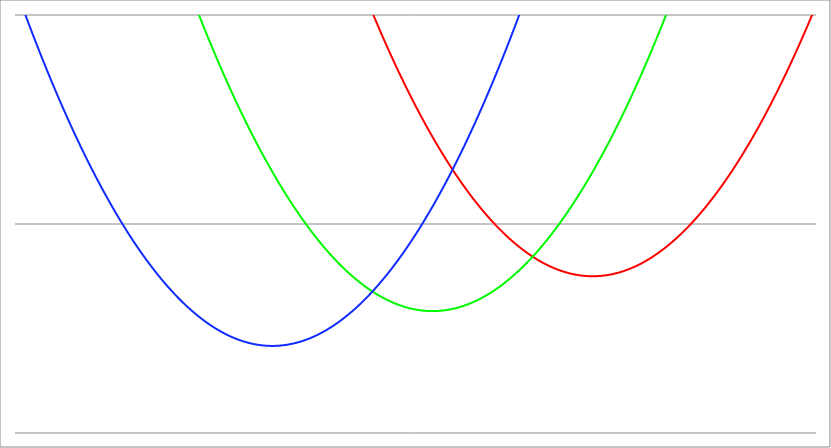
| Category | Series 1 | Series 0 | Series 2 |
|---|---|---|---|
| -5.2 | 50.34 | 24.54 | 6.74 |
| -5.195 | 50.268 | 24.488 | 6.708 |
| -5.19 | 50.196 | 24.436 | 6.676 |
| -5.185 | 50.124 | 24.384 | 6.644 |
| -5.180000000000001 | 50.052 | 24.332 | 6.612 |
| -5.175000000000001 | 49.981 | 24.281 | 6.581 |
| -5.170000000000001 | 49.909 | 24.229 | 6.549 |
| -5.165000000000001 | 49.837 | 24.177 | 6.517 |
| -5.160000000000001 | 49.766 | 24.126 | 6.486 |
| -5.155000000000001 | 49.694 | 24.074 | 6.454 |
| -5.150000000000001 | 49.623 | 24.023 | 6.423 |
| -5.145000000000001 | 49.551 | 23.971 | 6.391 |
| -5.140000000000001 | 49.48 | 23.92 | 6.36 |
| -5.135000000000002 | 49.408 | 23.868 | 6.328 |
| -5.130000000000002 | 49.337 | 23.817 | 6.297 |
| -5.125000000000002 | 49.266 | 23.766 | 6.266 |
| -5.120000000000002 | 49.194 | 23.714 | 6.234 |
| -5.115000000000002 | 49.123 | 23.663 | 6.203 |
| -5.110000000000002 | 49.052 | 23.612 | 6.172 |
| -5.105000000000002 | 48.981 | 23.561 | 6.141 |
| -5.100000000000002 | 48.91 | 23.51 | 6.11 |
| -5.095000000000002 | 48.839 | 23.459 | 6.079 |
| -5.090000000000002 | 48.768 | 23.408 | 6.048 |
| -5.085000000000003 | 48.697 | 23.357 | 6.017 |
| -5.080000000000003 | 48.626 | 23.306 | 5.986 |
| -5.075000000000003 | 48.556 | 23.256 | 5.956 |
| -5.070000000000003 | 48.485 | 23.205 | 5.925 |
| -5.065000000000003 | 48.414 | 23.154 | 5.894 |
| -5.060000000000003 | 48.344 | 23.104 | 5.864 |
| -5.055000000000003 | 48.273 | 23.053 | 5.833 |
| -5.050000000000003 | 48.203 | 23.003 | 5.803 |
| -5.045000000000003 | 48.132 | 22.952 | 5.772 |
| -5.040000000000004 | 48.062 | 22.902 | 5.742 |
| -5.035000000000004 | 47.991 | 22.851 | 5.711 |
| -5.030000000000004 | 47.921 | 22.801 | 5.681 |
| -5.025000000000004 | 47.851 | 22.751 | 5.651 |
| -5.020000000000004 | 47.78 | 22.7 | 5.62 |
| -5.015000000000004 | 47.71 | 22.65 | 5.59 |
| -5.010000000000004 | 47.64 | 22.6 | 5.56 |
| -5.005000000000004 | 47.57 | 22.55 | 5.53 |
| -5.000000000000004 | 47.5 | 22.5 | 5.5 |
| -4.995000000000004 | 47.43 | 22.45 | 5.47 |
| -4.990000000000004 | 47.36 | 22.4 | 5.44 |
| -4.985000000000004 | 47.29 | 22.35 | 5.41 |
| -4.980000000000004 | 47.22 | 22.3 | 5.38 |
| -4.975000000000004 | 47.151 | 22.251 | 5.351 |
| -4.970000000000005 | 47.081 | 22.201 | 5.321 |
| -4.965000000000005 | 47.011 | 22.151 | 5.291 |
| -4.960000000000005 | 46.942 | 22.102 | 5.262 |
| -4.955000000000005 | 46.872 | 22.052 | 5.232 |
| -4.950000000000005 | 46.803 | 22.003 | 5.203 |
| -4.945000000000005 | 46.733 | 21.953 | 5.173 |
| -4.940000000000005 | 46.664 | 21.904 | 5.144 |
| -4.935000000000005 | 46.594 | 21.854 | 5.114 |
| -4.930000000000005 | 46.525 | 21.805 | 5.085 |
| -4.925000000000006 | 46.456 | 21.756 | 5.056 |
| -4.920000000000006 | 46.386 | 21.706 | 5.026 |
| -4.915000000000006 | 46.317 | 21.657 | 4.997 |
| -4.910000000000006 | 46.248 | 21.608 | 4.968 |
| -4.905000000000006 | 46.179 | 21.559 | 4.939 |
| -4.900000000000006 | 46.11 | 21.51 | 4.91 |
| -4.895000000000007 | 46.041 | 21.461 | 4.881 |
| -4.890000000000007 | 45.972 | 21.412 | 4.852 |
| -4.885000000000007 | 45.903 | 21.363 | 4.823 |
| -4.880000000000007 | 45.834 | 21.314 | 4.794 |
| -4.875000000000007 | 45.766 | 21.266 | 4.766 |
| -4.870000000000007 | 45.697 | 21.217 | 4.737 |
| -4.865000000000007 | 45.628 | 21.168 | 4.708 |
| -4.860000000000007 | 45.56 | 21.12 | 4.68 |
| -4.855000000000007 | 45.491 | 21.071 | 4.651 |
| -4.850000000000008 | 45.423 | 21.023 | 4.623 |
| -4.845000000000008 | 45.354 | 20.974 | 4.594 |
| -4.840000000000008 | 45.286 | 20.926 | 4.566 |
| -4.835000000000008 | 45.217 | 20.877 | 4.537 |
| -4.830000000000008 | 45.149 | 20.829 | 4.509 |
| -4.825000000000008 | 45.081 | 20.781 | 4.481 |
| -4.820000000000008 | 45.012 | 20.732 | 4.452 |
| -4.815000000000008 | 44.944 | 20.684 | 4.424 |
| -4.810000000000008 | 44.876 | 20.636 | 4.396 |
| -4.805000000000009 | 44.808 | 20.588 | 4.368 |
| -4.800000000000009 | 44.74 | 20.54 | 4.34 |
| -4.795000000000009 | 44.672 | 20.492 | 4.312 |
| -4.790000000000009 | 44.604 | 20.444 | 4.284 |
| -4.785000000000009 | 44.536 | 20.396 | 4.256 |
| -4.78000000000001 | 44.468 | 20.348 | 4.228 |
| -4.77500000000001 | 44.401 | 20.301 | 4.201 |
| -4.77000000000001 | 44.333 | 20.253 | 4.173 |
| -4.765000000000009 | 44.265 | 20.205 | 4.145 |
| -4.760000000000009 | 44.198 | 20.158 | 4.118 |
| -4.75500000000001 | 44.13 | 20.11 | 4.09 |
| -4.75000000000001 | 44.063 | 20.063 | 4.063 |
| -4.74500000000001 | 43.995 | 20.015 | 4.035 |
| -4.74000000000001 | 43.928 | 19.968 | 4.008 |
| -4.73500000000001 | 43.86 | 19.92 | 3.98 |
| -4.73000000000001 | 43.793 | 19.873 | 3.953 |
| -4.72500000000001 | 43.726 | 19.826 | 3.926 |
| -4.72000000000001 | 43.658 | 19.778 | 3.898 |
| -4.71500000000001 | 43.591 | 19.731 | 3.871 |
| -4.710000000000011 | 43.524 | 19.684 | 3.844 |
| -4.705000000000011 | 43.457 | 19.637 | 3.817 |
| -4.700000000000011 | 43.39 | 19.59 | 3.79 |
| -4.695000000000011 | 43.323 | 19.543 | 3.763 |
| -4.690000000000011 | 43.256 | 19.496 | 3.736 |
| -4.685000000000011 | 43.189 | 19.449 | 3.709 |
| -4.680000000000011 | 43.122 | 19.402 | 3.682 |
| -4.675000000000011 | 43.056 | 19.356 | 3.656 |
| -4.670000000000011 | 42.989 | 19.309 | 3.629 |
| -4.665000000000011 | 42.922 | 19.262 | 3.602 |
| -4.660000000000012 | 42.856 | 19.216 | 3.576 |
| -4.655000000000012 | 42.789 | 19.169 | 3.549 |
| -4.650000000000012 | 42.723 | 19.123 | 3.523 |
| -4.645000000000012 | 42.656 | 19.076 | 3.496 |
| -4.640000000000012 | 42.59 | 19.03 | 3.47 |
| -4.635000000000012 | 42.523 | 18.983 | 3.443 |
| -4.630000000000012 | 42.457 | 18.937 | 3.417 |
| -4.625000000000012 | 42.391 | 18.891 | 3.391 |
| -4.620000000000012 | 42.324 | 18.844 | 3.364 |
| -4.615000000000013 | 42.258 | 18.798 | 3.338 |
| -4.610000000000013 | 42.192 | 18.752 | 3.312 |
| -4.605000000000013 | 42.126 | 18.706 | 3.286 |
| -4.600000000000013 | 42.06 | 18.66 | 3.26 |
| -4.595000000000013 | 41.994 | 18.614 | 3.234 |
| -4.590000000000013 | 41.928 | 18.568 | 3.208 |
| -4.585000000000013 | 41.862 | 18.522 | 3.182 |
| -4.580000000000013 | 41.796 | 18.476 | 3.156 |
| -4.575000000000013 | 41.731 | 18.431 | 3.131 |
| -4.570000000000014 | 41.665 | 18.385 | 3.105 |
| -4.565000000000014 | 41.599 | 18.339 | 3.079 |
| -4.560000000000014 | 41.534 | 18.294 | 3.054 |
| -4.555000000000014 | 41.468 | 18.248 | 3.028 |
| -4.550000000000014 | 41.403 | 18.203 | 3.003 |
| -4.545000000000014 | 41.337 | 18.157 | 2.977 |
| -4.540000000000014 | 41.272 | 18.112 | 2.952 |
| -4.535000000000014 | 41.206 | 18.066 | 2.926 |
| -4.530000000000014 | 41.141 | 18.021 | 2.901 |
| -4.525000000000015 | 41.076 | 17.976 | 2.876 |
| -4.520000000000015 | 41.01 | 17.93 | 2.85 |
| -4.515000000000015 | 40.945 | 17.885 | 2.825 |
| -4.510000000000015 | 40.88 | 17.84 | 2.8 |
| -4.505000000000015 | 40.815 | 17.795 | 2.775 |
| -4.500000000000015 | 40.75 | 17.75 | 2.75 |
| -4.495000000000015 | 40.685 | 17.705 | 2.725 |
| -4.490000000000015 | 40.62 | 17.66 | 2.7 |
| -4.485000000000015 | 40.555 | 17.615 | 2.675 |
| -4.480000000000015 | 40.49 | 17.57 | 2.65 |
| -4.475000000000015 | 40.426 | 17.526 | 2.626 |
| -4.470000000000015 | 40.361 | 17.481 | 2.601 |
| -4.465000000000016 | 40.296 | 17.436 | 2.576 |
| -4.460000000000016 | 40.232 | 17.392 | 2.552 |
| -4.455000000000016 | 40.167 | 17.347 | 2.527 |
| -4.450000000000016 | 40.103 | 17.303 | 2.503 |
| -4.445000000000016 | 40.038 | 17.258 | 2.478 |
| -4.440000000000016 | 39.974 | 17.214 | 2.454 |
| -4.435000000000016 | 39.909 | 17.169 | 2.429 |
| -4.430000000000016 | 39.845 | 17.125 | 2.405 |
| -4.425000000000017 | 39.781 | 17.081 | 2.381 |
| -4.420000000000017 | 39.716 | 17.036 | 2.356 |
| -4.415000000000017 | 39.652 | 16.992 | 2.332 |
| -4.410000000000017 | 39.588 | 16.948 | 2.308 |
| -4.405000000000017 | 39.524 | 16.904 | 2.284 |
| -4.400000000000017 | 39.46 | 16.86 | 2.26 |
| -4.395000000000017 | 39.396 | 16.816 | 2.236 |
| -4.390000000000017 | 39.332 | 16.772 | 2.212 |
| -4.385000000000017 | 39.268 | 16.728 | 2.188 |
| -4.380000000000018 | 39.204 | 16.684 | 2.164 |
| -4.375000000000018 | 39.141 | 16.641 | 2.141 |
| -4.370000000000018 | 39.077 | 16.597 | 2.117 |
| -4.365000000000018 | 39.013 | 16.553 | 2.093 |
| -4.360000000000018 | 38.95 | 16.51 | 2.07 |
| -4.355000000000018 | 38.886 | 16.466 | 2.046 |
| -4.350000000000018 | 38.823 | 16.423 | 2.023 |
| -4.345000000000018 | 38.759 | 16.379 | 1.999 |
| -4.340000000000018 | 38.696 | 16.336 | 1.976 |
| -4.335000000000019 | 38.632 | 16.292 | 1.952 |
| -4.330000000000019 | 38.569 | 16.249 | 1.929 |
| -4.325000000000019 | 38.506 | 16.206 | 1.906 |
| -4.320000000000019 | 38.442 | 16.162 | 1.882 |
| -4.315000000000019 | 38.379 | 16.119 | 1.859 |
| -4.310000000000019 | 38.316 | 16.076 | 1.836 |
| -4.305000000000019 | 38.253 | 16.033 | 1.813 |
| -4.300000000000019 | 38.19 | 15.99 | 1.79 |
| -4.295000000000019 | 38.127 | 15.947 | 1.767 |
| -4.29000000000002 | 38.064 | 15.904 | 1.744 |
| -4.28500000000002 | 38.001 | 15.861 | 1.721 |
| -4.28000000000002 | 37.938 | 15.818 | 1.698 |
| -4.27500000000002 | 37.876 | 15.776 | 1.676 |
| -4.27000000000002 | 37.813 | 15.733 | 1.653 |
| -4.26500000000002 | 37.75 | 15.69 | 1.63 |
| -4.26000000000002 | 37.688 | 15.648 | 1.608 |
| -4.25500000000002 | 37.625 | 15.605 | 1.585 |
| -4.25000000000002 | 37.563 | 15.563 | 1.563 |
| -4.24500000000002 | 37.5 | 15.52 | 1.54 |
| -4.24000000000002 | 37.438 | 15.478 | 1.518 |
| -4.23500000000002 | 37.375 | 15.435 | 1.495 |
| -4.23000000000002 | 37.313 | 15.393 | 1.473 |
| -4.225000000000021 | 37.251 | 15.351 | 1.451 |
| -4.220000000000021 | 37.188 | 15.308 | 1.428 |
| -4.215000000000021 | 37.126 | 15.266 | 1.406 |
| -4.210000000000021 | 37.064 | 15.224 | 1.384 |
| -4.205000000000021 | 37.002 | 15.182 | 1.362 |
| -4.200000000000021 | 36.94 | 15.14 | 1.34 |
| -4.195000000000022 | 36.878 | 15.098 | 1.318 |
| -4.190000000000022 | 36.816 | 15.056 | 1.296 |
| -4.185000000000022 | 36.754 | 15.014 | 1.274 |
| -4.180000000000022 | 36.692 | 14.972 | 1.252 |
| -4.175000000000022 | 36.631 | 14.931 | 1.231 |
| -4.170000000000022 | 36.569 | 14.889 | 1.209 |
| -4.165000000000022 | 36.507 | 14.847 | 1.187 |
| -4.160000000000022 | 36.446 | 14.806 | 1.166 |
| -4.155000000000022 | 36.384 | 14.764 | 1.144 |
| -4.150000000000023 | 36.323 | 14.723 | 1.123 |
| -4.145000000000023 | 36.261 | 14.681 | 1.101 |
| -4.140000000000023 | 36.2 | 14.64 | 1.08 |
| -4.135000000000023 | 36.138 | 14.598 | 1.058 |
| -4.130000000000023 | 36.077 | 14.557 | 1.037 |
| -4.125000000000023 | 36.016 | 14.516 | 1.016 |
| -4.120000000000023 | 35.954 | 14.474 | 0.994 |
| -4.115000000000023 | 35.893 | 14.433 | 0.973 |
| -4.110000000000023 | 35.832 | 14.392 | 0.952 |
| -4.105000000000024 | 35.771 | 14.351 | 0.931 |
| -4.100000000000024 | 35.71 | 14.31 | 0.91 |
| -4.095000000000024 | 35.649 | 14.269 | 0.889 |
| -4.090000000000024 | 35.588 | 14.228 | 0.868 |
| -4.085000000000024 | 35.527 | 14.187 | 0.847 |
| -4.080000000000024 | 35.466 | 14.146 | 0.826 |
| -4.075000000000024 | 35.406 | 14.106 | 0.806 |
| -4.070000000000024 | 35.345 | 14.065 | 0.785 |
| -4.065000000000024 | 35.284 | 14.024 | 0.764 |
| -4.060000000000024 | 35.224 | 13.984 | 0.744 |
| -4.055000000000024 | 35.163 | 13.943 | 0.723 |
| -4.050000000000024 | 35.103 | 13.903 | 0.703 |
| -4.045000000000024 | 35.042 | 13.862 | 0.682 |
| -4.040000000000024 | 34.982 | 13.822 | 0.662 |
| -4.035000000000025 | 34.921 | 13.781 | 0.641 |
| -4.030000000000025 | 34.861 | 13.741 | 0.621 |
| -4.025000000000025 | 34.801 | 13.701 | 0.601 |
| -4.020000000000025 | 34.74 | 13.66 | 0.58 |
| -4.015000000000025 | 34.68 | 13.62 | 0.56 |
| -4.010000000000025 | 34.62 | 13.58 | 0.54 |
| -4.005000000000025 | 34.56 | 13.54 | 0.52 |
| -4.000000000000025 | 34.5 | 13.5 | 0.5 |
| -3.995000000000026 | 34.44 | 13.46 | 0.48 |
| -3.990000000000026 | 34.38 | 13.42 | 0.46 |
| -3.985000000000026 | 34.32 | 13.38 | 0.44 |
| -3.980000000000026 | 34.26 | 13.34 | 0.42 |
| -3.975000000000026 | 34.201 | 13.301 | 0.401 |
| -3.970000000000026 | 34.141 | 13.261 | 0.381 |
| -3.965000000000026 | 34.081 | 13.221 | 0.361 |
| -3.960000000000027 | 34.022 | 13.182 | 0.342 |
| -3.955000000000027 | 33.962 | 13.142 | 0.322 |
| -3.950000000000027 | 33.903 | 13.103 | 0.303 |
| -3.945000000000027 | 33.843 | 13.063 | 0.283 |
| -3.940000000000027 | 33.784 | 13.024 | 0.264 |
| -3.935000000000027 | 33.724 | 12.984 | 0.244 |
| -3.930000000000027 | 33.665 | 12.945 | 0.225 |
| -3.925000000000027 | 33.606 | 12.906 | 0.206 |
| -3.920000000000027 | 33.546 | 12.866 | 0.186 |
| -3.915000000000028 | 33.487 | 12.827 | 0.167 |
| -3.910000000000028 | 33.428 | 12.788 | 0.148 |
| -3.905000000000028 | 33.369 | 12.749 | 0.129 |
| -3.900000000000028 | 33.31 | 12.71 | 0.11 |
| -3.895000000000028 | 33.251 | 12.671 | 0.091 |
| -3.890000000000028 | 33.192 | 12.632 | 0.072 |
| -3.885000000000028 | 33.133 | 12.593 | 0.053 |
| -3.880000000000028 | 33.074 | 12.554 | 0.034 |
| -3.875000000000028 | 33.016 | 12.516 | 0.016 |
| -3.870000000000028 | 32.957 | 12.477 | -0.003 |
| -3.865000000000029 | 32.898 | 12.438 | -0.022 |
| -3.860000000000029 | 32.84 | 12.4 | -0.04 |
| -3.855000000000029 | 32.781 | 12.361 | -0.059 |
| -3.850000000000029 | 32.723 | 12.323 | -0.077 |
| -3.845000000000029 | 32.664 | 12.284 | -0.096 |
| -3.840000000000029 | 32.606 | 12.246 | -0.114 |
| -3.835000000000029 | 32.547 | 12.207 | -0.133 |
| -3.830000000000029 | 32.489 | 12.169 | -0.151 |
| -3.825000000000029 | 32.431 | 12.131 | -0.169 |
| -3.82000000000003 | 32.372 | 12.092 | -0.188 |
| -3.81500000000003 | 32.314 | 12.054 | -0.206 |
| -3.81000000000003 | 32.256 | 12.016 | -0.224 |
| -3.80500000000003 | 32.198 | 11.978 | -0.242 |
| -3.80000000000003 | 32.14 | 11.94 | -0.26 |
| -3.79500000000003 | 32.082 | 11.902 | -0.278 |
| -3.79000000000003 | 32.024 | 11.864 | -0.296 |
| -3.78500000000003 | 31.966 | 11.826 | -0.314 |
| -3.78000000000003 | 31.908 | 11.788 | -0.332 |
| -3.77500000000003 | 31.851 | 11.751 | -0.349 |
| -3.770000000000031 | 31.793 | 11.713 | -0.367 |
| -3.765000000000031 | 31.735 | 11.675 | -0.385 |
| -3.760000000000031 | 31.678 | 11.638 | -0.402 |
| -3.755000000000031 | 31.62 | 11.6 | -0.42 |
| -3.750000000000031 | 31.563 | 11.563 | -0.437 |
| -3.745000000000031 | 31.505 | 11.525 | -0.455 |
| -3.740000000000031 | 31.448 | 11.488 | -0.472 |
| -3.735000000000031 | 31.39 | 11.45 | -0.49 |
| -3.730000000000031 | 31.333 | 11.413 | -0.507 |
| -3.725000000000032 | 31.276 | 11.376 | -0.524 |
| -3.720000000000032 | 31.218 | 11.338 | -0.542 |
| -3.715000000000032 | 31.161 | 11.301 | -0.559 |
| -3.710000000000032 | 31.104 | 11.264 | -0.576 |
| -3.705000000000032 | 31.047 | 11.227 | -0.593 |
| -3.700000000000032 | 30.99 | 11.19 | -0.61 |
| -3.695000000000032 | 30.933 | 11.153 | -0.627 |
| -3.690000000000032 | 30.876 | 11.116 | -0.644 |
| -3.685000000000032 | 30.819 | 11.079 | -0.661 |
| -3.680000000000032 | 30.762 | 11.042 | -0.678 |
| -3.675000000000033 | 30.706 | 11.006 | -0.694 |
| -3.670000000000033 | 30.649 | 10.969 | -0.711 |
| -3.665000000000033 | 30.592 | 10.932 | -0.728 |
| -3.660000000000033 | 30.536 | 10.896 | -0.744 |
| -3.655000000000033 | 30.479 | 10.859 | -0.761 |
| -3.650000000000033 | 30.423 | 10.823 | -0.777 |
| -3.645000000000033 | 30.366 | 10.786 | -0.794 |
| -3.640000000000033 | 30.31 | 10.75 | -0.81 |
| -3.635000000000033 | 30.253 | 10.713 | -0.827 |
| -3.630000000000034 | 30.197 | 10.677 | -0.843 |
| -3.625000000000034 | 30.141 | 10.641 | -0.859 |
| -3.620000000000034 | 30.084 | 10.604 | -0.876 |
| -3.615000000000034 | 30.028 | 10.568 | -0.892 |
| -3.610000000000034 | 29.972 | 10.532 | -0.908 |
| -3.605000000000034 | 29.916 | 10.496 | -0.924 |
| -3.600000000000034 | 29.86 | 10.46 | -0.94 |
| -3.595000000000034 | 29.804 | 10.424 | -0.956 |
| -3.590000000000034 | 29.748 | 10.388 | -0.972 |
| -3.585000000000035 | 29.692 | 10.352 | -0.988 |
| -3.580000000000035 | 29.636 | 10.316 | -1.004 |
| -3.575000000000035 | 29.581 | 10.281 | -1.019 |
| -3.570000000000035 | 29.525 | 10.245 | -1.035 |
| -3.565000000000035 | 29.469 | 10.209 | -1.051 |
| -3.560000000000035 | 29.414 | 10.174 | -1.066 |
| -3.555000000000035 | 29.358 | 10.138 | -1.082 |
| -3.550000000000035 | 29.303 | 10.103 | -1.097 |
| -3.545000000000035 | 29.247 | 10.067 | -1.113 |
| -3.540000000000036 | 29.192 | 10.032 | -1.128 |
| -3.535000000000036 | 29.136 | 9.996 | -1.144 |
| -3.530000000000036 | 29.081 | 9.961 | -1.159 |
| -3.525000000000036 | 29.026 | 9.926 | -1.174 |
| -3.520000000000036 | 28.97 | 9.89 | -1.19 |
| -3.515000000000036 | 28.915 | 9.855 | -1.205 |
| -3.510000000000036 | 28.86 | 9.82 | -1.22 |
| -3.505000000000036 | 28.805 | 9.785 | -1.235 |
| -3.500000000000036 | 28.75 | 9.75 | -1.25 |
| -3.495000000000036 | 28.695 | 9.715 | -1.265 |
| -3.490000000000037 | 28.64 | 9.68 | -1.28 |
| -3.485000000000037 | 28.585 | 9.645 | -1.295 |
| -3.480000000000037 | 28.53 | 9.61 | -1.31 |
| -3.475000000000037 | 28.476 | 9.576 | -1.324 |
| -3.470000000000037 | 28.421 | 9.541 | -1.339 |
| -3.465000000000037 | 28.366 | 9.506 | -1.354 |
| -3.460000000000037 | 28.312 | 9.472 | -1.368 |
| -3.455000000000037 | 28.257 | 9.437 | -1.383 |
| -3.450000000000037 | 28.203 | 9.403 | -1.397 |
| -3.445000000000038 | 28.148 | 9.368 | -1.412 |
| -3.440000000000038 | 28.094 | 9.334 | -1.426 |
| -3.435000000000038 | 28.039 | 9.299 | -1.441 |
| -3.430000000000038 | 27.985 | 9.265 | -1.455 |
| -3.425000000000038 | 27.931 | 9.231 | -1.469 |
| -3.420000000000038 | 27.876 | 9.196 | -1.484 |
| -3.415000000000038 | 27.822 | 9.162 | -1.498 |
| -3.410000000000038 | 27.768 | 9.128 | -1.512 |
| -3.405000000000038 | 27.714 | 9.094 | -1.526 |
| -3.400000000000039 | 27.66 | 9.06 | -1.54 |
| -3.395000000000039 | 27.606 | 9.026 | -1.554 |
| -3.390000000000039 | 27.552 | 8.992 | -1.568 |
| -3.385000000000039 | 27.498 | 8.958 | -1.582 |
| -3.380000000000039 | 27.444 | 8.924 | -1.596 |
| -3.375000000000039 | 27.391 | 8.891 | -1.609 |
| -3.370000000000039 | 27.337 | 8.857 | -1.623 |
| -3.365000000000039 | 27.283 | 8.823 | -1.637 |
| -3.360000000000039 | 27.23 | 8.79 | -1.65 |
| -3.355000000000039 | 27.176 | 8.756 | -1.664 |
| -3.35000000000004 | 27.123 | 8.723 | -1.677 |
| -3.34500000000004 | 27.069 | 8.689 | -1.691 |
| -3.34000000000004 | 27.016 | 8.656 | -1.704 |
| -3.33500000000004 | 26.962 | 8.622 | -1.718 |
| -3.33000000000004 | 26.909 | 8.589 | -1.731 |
| -3.32500000000004 | 26.856 | 8.556 | -1.744 |
| -3.32000000000004 | 26.802 | 8.522 | -1.758 |
| -3.31500000000004 | 26.749 | 8.489 | -1.771 |
| -3.31000000000004 | 26.696 | 8.456 | -1.784 |
| -3.305000000000041 | 26.643 | 8.423 | -1.797 |
| -3.300000000000041 | 26.59 | 8.39 | -1.81 |
| -3.295000000000041 | 26.537 | 8.357 | -1.823 |
| -3.290000000000041 | 26.484 | 8.324 | -1.836 |
| -3.285000000000041 | 26.431 | 8.291 | -1.849 |
| -3.280000000000041 | 26.378 | 8.258 | -1.862 |
| -3.275000000000041 | 26.326 | 8.226 | -1.874 |
| -3.270000000000041 | 26.273 | 8.193 | -1.887 |
| -3.265000000000041 | 26.22 | 8.16 | -1.9 |
| -3.260000000000042 | 26.168 | 8.128 | -1.912 |
| -3.255000000000042 | 26.115 | 8.095 | -1.925 |
| -3.250000000000042 | 26.063 | 8.063 | -1.937 |
| -3.245000000000042 | 26.01 | 8.03 | -1.95 |
| -3.240000000000042 | 25.958 | 7.998 | -1.962 |
| -3.235000000000042 | 25.905 | 7.965 | -1.975 |
| -3.230000000000042 | 25.853 | 7.933 | -1.987 |
| -3.225000000000042 | 25.801 | 7.901 | -1.999 |
| -3.220000000000042 | 25.748 | 7.868 | -2.012 |
| -3.215000000000042 | 25.696 | 7.836 | -2.024 |
| -3.210000000000043 | 25.644 | 7.804 | -2.036 |
| -3.205000000000043 | 25.592 | 7.772 | -2.048 |
| -3.200000000000043 | 25.54 | 7.74 | -2.06 |
| -3.195000000000043 | 25.488 | 7.708 | -2.072 |
| -3.190000000000043 | 25.436 | 7.676 | -2.084 |
| -3.185000000000043 | 25.384 | 7.644 | -2.096 |
| -3.180000000000043 | 25.332 | 7.612 | -2.108 |
| -3.175000000000043 | 25.281 | 7.581 | -2.119 |
| -3.170000000000043 | 25.229 | 7.549 | -2.131 |
| -3.165000000000044 | 25.177 | 7.517 | -2.143 |
| -3.160000000000044 | 25.126 | 7.486 | -2.154 |
| -3.155000000000044 | 25.074 | 7.454 | -2.166 |
| -3.150000000000044 | 25.023 | 7.423 | -2.177 |
| -3.145000000000044 | 24.971 | 7.391 | -2.189 |
| -3.140000000000044 | 24.92 | 7.36 | -2.2 |
| -3.135000000000044 | 24.868 | 7.328 | -2.212 |
| -3.130000000000044 | 24.817 | 7.297 | -2.223 |
| -3.125000000000044 | 24.766 | 7.266 | -2.234 |
| -3.120000000000045 | 24.714 | 7.234 | -2.246 |
| -3.115000000000045 | 24.663 | 7.203 | -2.257 |
| -3.110000000000045 | 24.612 | 7.172 | -2.268 |
| -3.105000000000045 | 24.561 | 7.141 | -2.279 |
| -3.100000000000045 | 24.51 | 7.11 | -2.29 |
| -3.095000000000045 | 24.459 | 7.079 | -2.301 |
| -3.090000000000045 | 24.408 | 7.048 | -2.312 |
| -3.085000000000045 | 24.357 | 7.017 | -2.323 |
| -3.080000000000045 | 24.306 | 6.986 | -2.334 |
| -3.075000000000045 | 24.256 | 6.956 | -2.344 |
| -3.070000000000046 | 24.205 | 6.925 | -2.355 |
| -3.065000000000046 | 24.154 | 6.894 | -2.366 |
| -3.060000000000046 | 24.104 | 6.864 | -2.376 |
| -3.055000000000046 | 24.053 | 6.833 | -2.387 |
| -3.050000000000046 | 24.003 | 6.803 | -2.397 |
| -3.045000000000046 | 23.952 | 6.772 | -2.408 |
| -3.040000000000046 | 23.902 | 6.742 | -2.418 |
| -3.035000000000046 | 23.851 | 6.711 | -2.429 |
| -3.030000000000046 | 23.801 | 6.681 | -2.439 |
| -3.025000000000047 | 23.751 | 6.651 | -2.449 |
| -3.020000000000047 | 23.7 | 6.62 | -2.46 |
| -3.015000000000047 | 23.65 | 6.59 | -2.47 |
| -3.010000000000047 | 23.6 | 6.56 | -2.48 |
| -3.005000000000047 | 23.55 | 6.53 | -2.49 |
| -3.000000000000047 | 23.5 | 6.5 | -2.5 |
| -2.995000000000047 | 23.45 | 6.47 | -2.51 |
| -2.990000000000047 | 23.4 | 6.44 | -2.52 |
| -2.985000000000047 | 23.35 | 6.41 | -2.53 |
| -2.980000000000047 | 23.3 | 6.38 | -2.54 |
| -2.975000000000048 | 23.251 | 6.351 | -2.549 |
| -2.970000000000048 | 23.201 | 6.321 | -2.559 |
| -2.965000000000048 | 23.151 | 6.291 | -2.569 |
| -2.960000000000048 | 23.102 | 6.262 | -2.578 |
| -2.955000000000048 | 23.052 | 6.232 | -2.588 |
| -2.950000000000048 | 23.003 | 6.203 | -2.597 |
| -2.945000000000048 | 22.953 | 6.173 | -2.607 |
| -2.940000000000048 | 22.904 | 6.144 | -2.616 |
| -2.935000000000048 | 22.854 | 6.114 | -2.626 |
| -2.930000000000049 | 22.805 | 6.085 | -2.635 |
| -2.925000000000049 | 22.756 | 6.056 | -2.644 |
| -2.920000000000049 | 22.706 | 6.026 | -2.654 |
| -2.915000000000049 | 22.657 | 5.997 | -2.663 |
| -2.910000000000049 | 22.608 | 5.968 | -2.672 |
| -2.905000000000049 | 22.559 | 5.939 | -2.681 |
| -2.900000000000049 | 22.51 | 5.91 | -2.69 |
| -2.895000000000049 | 22.461 | 5.881 | -2.699 |
| -2.890000000000049 | 22.412 | 5.852 | -2.708 |
| -2.885000000000049 | 22.363 | 5.823 | -2.717 |
| -2.88000000000005 | 22.314 | 5.794 | -2.726 |
| -2.87500000000005 | 22.266 | 5.766 | -2.734 |
| -2.87000000000005 | 22.217 | 5.737 | -2.743 |
| -2.86500000000005 | 22.168 | 5.708 | -2.752 |
| -2.86000000000005 | 22.12 | 5.68 | -2.76 |
| -2.85500000000005 | 22.071 | 5.651 | -2.769 |
| -2.85000000000005 | 22.023 | 5.623 | -2.777 |
| -2.84500000000005 | 21.974 | 5.594 | -2.786 |
| -2.84000000000005 | 21.926 | 5.566 | -2.794 |
| -2.835000000000051 | 21.877 | 5.537 | -2.803 |
| -2.830000000000051 | 21.829 | 5.509 | -2.811 |
| -2.825000000000051 | 21.781 | 5.481 | -2.819 |
| -2.820000000000051 | 21.732 | 5.452 | -2.828 |
| -2.815000000000051 | 21.684 | 5.424 | -2.836 |
| -2.810000000000051 | 21.636 | 5.396 | -2.844 |
| -2.805000000000051 | 21.588 | 5.368 | -2.852 |
| -2.800000000000051 | 21.54 | 5.34 | -2.86 |
| -2.795000000000051 | 21.492 | 5.312 | -2.868 |
| -2.790000000000051 | 21.444 | 5.284 | -2.876 |
| -2.785000000000052 | 21.396 | 5.256 | -2.884 |
| -2.780000000000052 | 21.348 | 5.228 | -2.892 |
| -2.775000000000052 | 21.301 | 5.201 | -2.899 |
| -2.770000000000052 | 21.253 | 5.173 | -2.907 |
| -2.765000000000052 | 21.205 | 5.145 | -2.915 |
| -2.760000000000052 | 21.158 | 5.118 | -2.922 |
| -2.755000000000052 | 21.11 | 5.09 | -2.93 |
| -2.750000000000052 | 21.063 | 5.063 | -2.937 |
| -2.745000000000052 | 21.015 | 5.035 | -2.945 |
| -2.740000000000052 | 20.968 | 5.008 | -2.952 |
| -2.735000000000053 | 20.92 | 4.98 | -2.96 |
| -2.730000000000053 | 20.873 | 4.953 | -2.967 |
| -2.725000000000053 | 20.826 | 4.926 | -2.974 |
| -2.720000000000053 | 20.778 | 4.898 | -2.982 |
| -2.715000000000053 | 20.731 | 4.871 | -2.989 |
| -2.710000000000053 | 20.684 | 4.844 | -2.996 |
| -2.705000000000053 | 20.637 | 4.817 | -3.003 |
| -2.700000000000053 | 20.59 | 4.79 | -3.01 |
| -2.695000000000053 | 20.543 | 4.763 | -3.017 |
| -2.690000000000054 | 20.496 | 4.736 | -3.024 |
| -2.685000000000054 | 20.449 | 4.709 | -3.031 |
| -2.680000000000054 | 20.402 | 4.682 | -3.038 |
| -2.675000000000054 | 20.356 | 4.656 | -3.044 |
| -2.670000000000054 | 20.309 | 4.629 | -3.051 |
| -2.665000000000054 | 20.262 | 4.602 | -3.058 |
| -2.660000000000054 | 20.216 | 4.576 | -3.064 |
| -2.655000000000054 | 20.169 | 4.549 | -3.071 |
| -2.650000000000054 | 20.123 | 4.523 | -3.077 |
| -2.645000000000055 | 20.076 | 4.496 | -3.084 |
| -2.640000000000055 | 20.03 | 4.47 | -3.09 |
| -2.635000000000055 | 19.983 | 4.443 | -3.097 |
| -2.630000000000055 | 19.937 | 4.417 | -3.103 |
| -2.625000000000055 | 19.891 | 4.391 | -3.109 |
| -2.620000000000055 | 19.844 | 4.364 | -3.116 |
| -2.615000000000055 | 19.798 | 4.338 | -3.122 |
| -2.610000000000055 | 19.752 | 4.312 | -3.128 |
| -2.605000000000055 | 19.706 | 4.286 | -3.134 |
| -2.600000000000056 | 19.66 | 4.26 | -3.14 |
| -2.595000000000056 | 19.614 | 4.234 | -3.146 |
| -2.590000000000056 | 19.568 | 4.208 | -3.152 |
| -2.585000000000056 | 19.522 | 4.182 | -3.158 |
| -2.580000000000056 | 19.476 | 4.156 | -3.164 |
| -2.575000000000056 | 19.431 | 4.131 | -3.169 |
| -2.570000000000056 | 19.385 | 4.105 | -3.175 |
| -2.565000000000056 | 19.339 | 4.079 | -3.181 |
| -2.560000000000056 | 19.294 | 4.054 | -3.186 |
| -2.555000000000057 | 19.248 | 4.028 | -3.192 |
| -2.550000000000057 | 19.203 | 4.003 | -3.197 |
| -2.545000000000057 | 19.157 | 3.977 | -3.203 |
| -2.540000000000057 | 19.112 | 3.952 | -3.208 |
| -2.535000000000057 | 19.066 | 3.926 | -3.214 |
| -2.530000000000057 | 19.021 | 3.901 | -3.219 |
| -2.525000000000057 | 18.976 | 3.876 | -3.224 |
| -2.520000000000057 | 18.93 | 3.85 | -3.23 |
| -2.515000000000057 | 18.885 | 3.825 | -3.235 |
| -2.510000000000058 | 18.84 | 3.8 | -3.24 |
| -2.505000000000058 | 18.795 | 3.775 | -3.245 |
| -2.500000000000058 | 18.75 | 3.75 | -3.25 |
| -2.495000000000058 | 18.705 | 3.725 | -3.255 |
| -2.490000000000058 | 18.66 | 3.7 | -3.26 |
| -2.485000000000058 | 18.615 | 3.675 | -3.265 |
| -2.480000000000058 | 18.57 | 3.65 | -3.27 |
| -2.475000000000058 | 18.526 | 3.626 | -3.274 |
| -2.470000000000058 | 18.481 | 3.601 | -3.279 |
| -2.465000000000058 | 18.436 | 3.576 | -3.284 |
| -2.460000000000059 | 18.392 | 3.552 | -3.288 |
| -2.455000000000059 | 18.347 | 3.527 | -3.293 |
| -2.450000000000059 | 18.303 | 3.503 | -3.297 |
| -2.445000000000059 | 18.258 | 3.478 | -3.302 |
| -2.440000000000059 | 18.214 | 3.454 | -3.306 |
| -2.435000000000059 | 18.169 | 3.429 | -3.311 |
| -2.430000000000059 | 18.125 | 3.405 | -3.315 |
| -2.425000000000059 | 18.081 | 3.381 | -3.319 |
| -2.420000000000059 | 18.036 | 3.356 | -3.324 |
| -2.41500000000006 | 17.992 | 3.332 | -3.328 |
| -2.41000000000006 | 17.948 | 3.308 | -3.332 |
| -2.40500000000006 | 17.904 | 3.284 | -3.336 |
| -2.40000000000006 | 17.86 | 3.26 | -3.34 |
| -2.39500000000006 | 17.816 | 3.236 | -3.344 |
| -2.39000000000006 | 17.772 | 3.212 | -3.348 |
| -2.38500000000006 | 17.728 | 3.188 | -3.352 |
| -2.38000000000006 | 17.684 | 3.164 | -3.356 |
| -2.37500000000006 | 17.641 | 3.141 | -3.359 |
| -2.37000000000006 | 17.597 | 3.117 | -3.363 |
| -2.365000000000061 | 17.553 | 3.093 | -3.367 |
| -2.360000000000061 | 17.51 | 3.07 | -3.37 |
| -2.355000000000061 | 17.466 | 3.046 | -3.374 |
| -2.350000000000061 | 17.423 | 3.023 | -3.377 |
| -2.345000000000061 | 17.379 | 2.999 | -3.381 |
| -2.340000000000061 | 17.336 | 2.976 | -3.384 |
| -2.335000000000061 | 17.292 | 2.952 | -3.388 |
| -2.330000000000061 | 17.249 | 2.929 | -3.391 |
| -2.325000000000061 | 17.206 | 2.906 | -3.394 |
| -2.320000000000062 | 17.162 | 2.882 | -3.398 |
| -2.315000000000062 | 17.119 | 2.859 | -3.401 |
| -2.310000000000062 | 17.076 | 2.836 | -3.404 |
| -2.305000000000062 | 17.033 | 2.813 | -3.407 |
| -2.300000000000062 | 16.99 | 2.79 | -3.41 |
| -2.295000000000062 | 16.947 | 2.767 | -3.413 |
| -2.290000000000062 | 16.904 | 2.744 | -3.416 |
| -2.285000000000062 | 16.861 | 2.721 | -3.419 |
| -2.280000000000062 | 16.818 | 2.698 | -3.422 |
| -2.275000000000063 | 16.776 | 2.676 | -3.424 |
| -2.270000000000063 | 16.733 | 2.653 | -3.427 |
| -2.265000000000063 | 16.69 | 2.63 | -3.43 |
| -2.260000000000063 | 16.648 | 2.608 | -3.432 |
| -2.255000000000063 | 16.605 | 2.585 | -3.435 |
| -2.250000000000063 | 16.563 | 2.563 | -3.437 |
| -2.245000000000063 | 16.52 | 2.54 | -3.44 |
| -2.240000000000063 | 16.478 | 2.518 | -3.442 |
| -2.235000000000063 | 16.435 | 2.495 | -3.445 |
| -2.230000000000063 | 16.393 | 2.473 | -3.447 |
| -2.225000000000064 | 16.351 | 2.451 | -3.449 |
| -2.220000000000064 | 16.308 | 2.428 | -3.452 |
| -2.215000000000064 | 16.266 | 2.406 | -3.454 |
| -2.210000000000064 | 16.224 | 2.384 | -3.456 |
| -2.205000000000064 | 16.182 | 2.362 | -3.458 |
| -2.200000000000064 | 16.14 | 2.34 | -3.46 |
| -2.195000000000064 | 16.098 | 2.318 | -3.462 |
| -2.190000000000064 | 16.056 | 2.296 | -3.464 |
| -2.185000000000064 | 16.014 | 2.274 | -3.466 |
| -2.180000000000065 | 15.972 | 2.252 | -3.468 |
| -2.175000000000065 | 15.931 | 2.231 | -3.469 |
| -2.170000000000065 | 15.889 | 2.209 | -3.471 |
| -2.165000000000065 | 15.847 | 2.187 | -3.473 |
| -2.160000000000065 | 15.806 | 2.166 | -3.474 |
| -2.155000000000065 | 15.764 | 2.144 | -3.476 |
| -2.150000000000065 | 15.723 | 2.123 | -3.477 |
| -2.145000000000065 | 15.681 | 2.101 | -3.479 |
| -2.140000000000065 | 15.64 | 2.08 | -3.48 |
| -2.135000000000065 | 15.598 | 2.058 | -3.482 |
| -2.130000000000066 | 15.557 | 2.037 | -3.483 |
| -2.125000000000066 | 15.516 | 2.016 | -3.484 |
| -2.120000000000066 | 15.474 | 1.994 | -3.486 |
| -2.115000000000066 | 15.433 | 1.973 | -3.487 |
| -2.110000000000066 | 15.392 | 1.952 | -3.488 |
| -2.105000000000066 | 15.351 | 1.931 | -3.489 |
| -2.100000000000066 | 15.31 | 1.91 | -3.49 |
| -2.095000000000066 | 15.269 | 1.889 | -3.491 |
| -2.090000000000066 | 15.228 | 1.868 | -3.492 |
| -2.085000000000067 | 15.187 | 1.847 | -3.493 |
| -2.080000000000067 | 15.146 | 1.826 | -3.494 |
| -2.075000000000067 | 15.106 | 1.806 | -3.494 |
| -2.070000000000067 | 15.065 | 1.785 | -3.495 |
| -2.065000000000067 | 15.024 | 1.764 | -3.496 |
| -2.060000000000067 | 14.984 | 1.744 | -3.496 |
| -2.055000000000067 | 14.943 | 1.723 | -3.497 |
| -2.050000000000067 | 14.903 | 1.703 | -3.497 |
| -2.045000000000067 | 14.862 | 1.682 | -3.498 |
| -2.040000000000068 | 14.822 | 1.662 | -3.498 |
| -2.035000000000068 | 14.781 | 1.641 | -3.499 |
| -2.030000000000068 | 14.741 | 1.621 | -3.499 |
| -2.025000000000068 | 14.701 | 1.601 | -3.499 |
| -2.020000000000068 | 14.66 | 1.58 | -3.5 |
| -2.015000000000068 | 14.62 | 1.56 | -3.5 |
| -2.010000000000068 | 14.58 | 1.54 | -3.5 |
| -2.005000000000068 | 14.54 | 1.52 | -3.5 |
| -2.000000000000068 | 14.5 | 1.5 | -3.5 |
| -1.995000000000068 | 14.46 | 1.48 | -3.5 |
| -1.990000000000069 | 14.42 | 1.46 | -3.5 |
| -1.985000000000069 | 14.38 | 1.44 | -3.5 |
| -1.980000000000069 | 14.34 | 1.42 | -3.5 |
| -1.975000000000069 | 14.301 | 1.401 | -3.499 |
| -1.97000000000007 | 14.261 | 1.381 | -3.499 |
| -1.965000000000069 | 14.221 | 1.361 | -3.499 |
| -1.960000000000069 | 14.182 | 1.342 | -3.498 |
| -1.955000000000069 | 14.142 | 1.322 | -3.498 |
| -1.950000000000069 | 14.103 | 1.303 | -3.498 |
| -1.94500000000007 | 14.063 | 1.283 | -3.497 |
| -1.94000000000007 | 14.024 | 1.264 | -3.496 |
| -1.93500000000007 | 13.984 | 1.244 | -3.496 |
| -1.93000000000007 | 13.945 | 1.225 | -3.495 |
| -1.92500000000007 | 13.906 | 1.206 | -3.494 |
| -1.92000000000007 | 13.866 | 1.186 | -3.494 |
| -1.91500000000007 | 13.827 | 1.167 | -3.493 |
| -1.91000000000007 | 13.788 | 1.148 | -3.492 |
| -1.90500000000007 | 13.749 | 1.129 | -3.491 |
| -1.90000000000007 | 13.71 | 1.11 | -3.49 |
| -1.895000000000071 | 13.671 | 1.091 | -3.489 |
| -1.890000000000071 | 13.632 | 1.072 | -3.488 |
| -1.885000000000071 | 13.593 | 1.053 | -3.487 |
| -1.880000000000071 | 13.554 | 1.034 | -3.486 |
| -1.875000000000071 | 13.516 | 1.016 | -3.484 |
| -1.870000000000071 | 13.477 | 0.997 | -3.483 |
| -1.865000000000071 | 13.438 | 0.978 | -3.482 |
| -1.860000000000071 | 13.4 | 0.96 | -3.48 |
| -1.855000000000071 | 13.361 | 0.941 | -3.479 |
| -1.850000000000072 | 13.323 | 0.923 | -3.478 |
| -1.845000000000072 | 13.284 | 0.904 | -3.476 |
| -1.840000000000072 | 13.246 | 0.886 | -3.474 |
| -1.835000000000072 | 13.207 | 0.867 | -3.473 |
| -1.830000000000072 | 13.169 | 0.849 | -3.471 |
| -1.825000000000072 | 13.131 | 0.831 | -3.469 |
| -1.820000000000072 | 13.092 | 0.812 | -3.468 |
| -1.815000000000072 | 13.054 | 0.794 | -3.466 |
| -1.810000000000072 | 13.016 | 0.776 | -3.464 |
| -1.805000000000073 | 12.978 | 0.758 | -3.462 |
| -1.800000000000073 | 12.94 | 0.74 | -3.46 |
| -1.795000000000073 | 12.902 | 0.722 | -3.458 |
| -1.790000000000073 | 12.864 | 0.704 | -3.456 |
| -1.785000000000073 | 12.826 | 0.686 | -3.454 |
| -1.780000000000073 | 12.788 | 0.668 | -3.452 |
| -1.775000000000073 | 12.751 | 0.651 | -3.449 |
| -1.770000000000073 | 12.713 | 0.633 | -3.447 |
| -1.765000000000073 | 12.675 | 0.615 | -3.445 |
| -1.760000000000073 | 12.638 | 0.598 | -3.442 |
| -1.755000000000074 | 12.6 | 0.58 | -3.44 |
| -1.750000000000074 | 12.563 | 0.563 | -3.438 |
| -1.745000000000074 | 12.525 | 0.545 | -3.435 |
| -1.740000000000074 | 12.488 | 0.528 | -3.432 |
| -1.735000000000074 | 12.45 | 0.51 | -3.43 |
| -1.730000000000074 | 12.413 | 0.493 | -3.427 |
| -1.725000000000074 | 12.376 | 0.476 | -3.424 |
| -1.720000000000074 | 12.338 | 0.458 | -3.422 |
| -1.715000000000074 | 12.301 | 0.441 | -3.419 |
| -1.710000000000075 | 12.264 | 0.424 | -3.416 |
| -1.705000000000075 | 12.227 | 0.407 | -3.413 |
| -1.700000000000075 | 12.19 | 0.39 | -3.41 |
| -1.695000000000075 | 12.153 | 0.373 | -3.407 |
| -1.690000000000075 | 12.116 | 0.356 | -3.404 |
| -1.685000000000075 | 12.079 | 0.339 | -3.401 |
| -1.680000000000075 | 12.042 | 0.322 | -3.398 |
| -1.675000000000075 | 12.006 | 0.306 | -3.394 |
| -1.670000000000075 | 11.969 | 0.289 | -3.391 |
| -1.665000000000075 | 11.932 | 0.272 | -3.388 |
| -1.660000000000076 | 11.896 | 0.256 | -3.384 |
| -1.655000000000076 | 11.859 | 0.239 | -3.381 |
| -1.650000000000076 | 11.823 | 0.223 | -3.378 |
| -1.645000000000076 | 11.786 | 0.206 | -3.374 |
| -1.640000000000076 | 11.75 | 0.19 | -3.37 |
| -1.635000000000076 | 11.713 | 0.173 | -3.367 |
| -1.630000000000076 | 11.677 | 0.157 | -3.363 |
| -1.625000000000076 | 11.641 | 0.141 | -3.359 |
| -1.620000000000076 | 11.604 | 0.124 | -3.356 |
| -1.615000000000077 | 11.568 | 0.108 | -3.352 |
| -1.610000000000077 | 11.532 | 0.092 | -3.348 |
| -1.605000000000077 | 11.496 | 0.076 | -3.344 |
| -1.600000000000077 | 11.46 | 0.06 | -3.34 |
| -1.595000000000077 | 11.424 | 0.044 | -3.336 |
| -1.590000000000077 | 11.388 | 0.028 | -3.332 |
| -1.585000000000077 | 11.352 | 0.012 | -3.328 |
| -1.580000000000077 | 11.316 | -0.004 | -3.324 |
| -1.575000000000077 | 11.281 | -0.019 | -3.319 |
| -1.570000000000078 | 11.245 | -0.035 | -3.315 |
| -1.565000000000078 | 11.209 | -0.051 | -3.311 |
| -1.560000000000078 | 11.174 | -0.066 | -3.306 |
| -1.555000000000078 | 11.138 | -0.082 | -3.302 |
| -1.550000000000078 | 11.103 | -0.097 | -3.298 |
| -1.545000000000078 | 11.067 | -0.113 | -3.293 |
| -1.540000000000078 | 11.032 | -0.128 | -3.288 |
| -1.535000000000078 | 10.996 | -0.144 | -3.284 |
| -1.530000000000078 | 10.961 | -0.159 | -3.279 |
| -1.525000000000079 | 10.926 | -0.174 | -3.274 |
| -1.520000000000079 | 10.89 | -0.19 | -3.27 |
| -1.515000000000079 | 10.855 | -0.205 | -3.265 |
| -1.510000000000079 | 10.82 | -0.22 | -3.26 |
| -1.505000000000079 | 10.785 | -0.235 | -3.255 |
| -1.50000000000008 | 10.75 | -0.25 | -3.25 |
| -1.495000000000079 | 10.715 | -0.265 | -3.245 |
| -1.490000000000079 | 10.68 | -0.28 | -3.24 |
| -1.485000000000079 | 10.645 | -0.295 | -3.235 |
| -1.480000000000079 | 10.61 | -0.31 | -3.23 |
| -1.47500000000008 | 10.576 | -0.324 | -3.224 |
| -1.47000000000008 | 10.541 | -0.339 | -3.219 |
| -1.46500000000008 | 10.506 | -0.354 | -3.214 |
| -1.46000000000008 | 10.472 | -0.368 | -3.208 |
| -1.45500000000008 | 10.437 | -0.383 | -3.203 |
| -1.45000000000008 | 10.403 | -0.397 | -3.198 |
| -1.44500000000008 | 10.368 | -0.412 | -3.192 |
| -1.44000000000008 | 10.334 | -0.426 | -3.186 |
| -1.43500000000008 | 10.299 | -0.441 | -3.181 |
| -1.430000000000081 | 10.265 | -0.455 | -3.175 |
| -1.425000000000081 | 10.231 | -0.469 | -3.169 |
| -1.420000000000081 | 10.196 | -0.484 | -3.164 |
| -1.415000000000081 | 10.162 | -0.498 | -3.158 |
| -1.410000000000081 | 10.128 | -0.512 | -3.152 |
| -1.405000000000081 | 10.094 | -0.526 | -3.146 |
| -1.400000000000081 | 10.06 | -0.54 | -3.14 |
| -1.395000000000081 | 10.026 | -0.554 | -3.134 |
| -1.390000000000081 | 9.992 | -0.568 | -3.128 |
| -1.385000000000081 | 9.958 | -0.582 | -3.122 |
| -1.380000000000082 | 9.924 | -0.596 | -3.116 |
| -1.375000000000082 | 9.891 | -0.609 | -3.109 |
| -1.370000000000082 | 9.857 | -0.623 | -3.103 |
| -1.365000000000082 | 9.823 | -0.637 | -3.097 |
| -1.360000000000082 | 9.79 | -0.65 | -3.09 |
| -1.355000000000082 | 9.756 | -0.664 | -3.084 |
| -1.350000000000082 | 9.723 | -0.677 | -3.078 |
| -1.345000000000082 | 9.689 | -0.691 | -3.071 |
| -1.340000000000082 | 9.656 | -0.704 | -3.064 |
| -1.335000000000083 | 9.622 | -0.718 | -3.058 |
| -1.330000000000083 | 9.589 | -0.731 | -3.051 |
| -1.325000000000083 | 9.556 | -0.744 | -3.044 |
| -1.320000000000083 | 9.522 | -0.758 | -3.038 |
| -1.315000000000083 | 9.489 | -0.771 | -3.031 |
| -1.310000000000083 | 9.456 | -0.784 | -3.024 |
| -1.305000000000083 | 9.423 | -0.797 | -3.017 |
| -1.300000000000083 | 9.39 | -0.81 | -3.01 |
| -1.295000000000083 | 9.357 | -0.823 | -3.003 |
| -1.290000000000083 | 9.324 | -0.836 | -2.996 |
| -1.285000000000084 | 9.291 | -0.849 | -2.989 |
| -1.280000000000084 | 9.258 | -0.862 | -2.982 |
| -1.275000000000084 | 9.226 | -0.874 | -2.974 |
| -1.270000000000084 | 9.193 | -0.887 | -2.967 |
| -1.265000000000084 | 9.16 | -0.9 | -2.96 |
| -1.260000000000084 | 9.128 | -0.912 | -2.952 |
| -1.255000000000084 | 9.095 | -0.925 | -2.945 |
| -1.250000000000084 | 9.063 | -0.937 | -2.938 |
| -1.245000000000084 | 9.03 | -0.95 | -2.93 |
| -1.240000000000085 | 8.998 | -0.962 | -2.922 |
| -1.235000000000085 | 8.965 | -0.975 | -2.915 |
| -1.230000000000085 | 8.933 | -0.987 | -2.907 |
| -1.225000000000085 | 8.901 | -0.999 | -2.899 |
| -1.220000000000085 | 8.868 | -1.012 | -2.892 |
| -1.215000000000085 | 8.836 | -1.024 | -2.884 |
| -1.210000000000085 | 8.804 | -1.036 | -2.876 |
| -1.205000000000085 | 8.772 | -1.048 | -2.868 |
| -1.200000000000085 | 8.74 | -1.06 | -2.86 |
| -1.195000000000086 | 8.708 | -1.072 | -2.852 |
| -1.190000000000086 | 8.676 | -1.084 | -2.844 |
| -1.185000000000086 | 8.644 | -1.096 | -2.836 |
| -1.180000000000086 | 8.612 | -1.108 | -2.828 |
| -1.175000000000086 | 8.581 | -1.119 | -2.819 |
| -1.170000000000086 | 8.549 | -1.131 | -2.811 |
| -1.165000000000086 | 8.517 | -1.143 | -2.803 |
| -1.160000000000086 | 8.486 | -1.154 | -2.794 |
| -1.155000000000086 | 8.454 | -1.166 | -2.786 |
| -1.150000000000086 | 8.423 | -1.177 | -2.778 |
| -1.145000000000087 | 8.391 | -1.189 | -2.769 |
| -1.140000000000087 | 8.36 | -1.2 | -2.76 |
| -1.135000000000087 | 8.328 | -1.212 | -2.752 |
| -1.130000000000087 | 8.297 | -1.223 | -2.743 |
| -1.125000000000087 | 8.266 | -1.234 | -2.734 |
| -1.120000000000087 | 8.234 | -1.246 | -2.726 |
| -1.115000000000087 | 8.203 | -1.257 | -2.717 |
| -1.110000000000087 | 8.172 | -1.268 | -2.708 |
| -1.105000000000087 | 8.141 | -1.279 | -2.699 |
| -1.100000000000088 | 8.11 | -1.29 | -2.69 |
| -1.095000000000088 | 8.079 | -1.301 | -2.681 |
| -1.090000000000088 | 8.048 | -1.312 | -2.672 |
| -1.085000000000088 | 8.017 | -1.323 | -2.663 |
| -1.080000000000088 | 7.986 | -1.334 | -2.654 |
| -1.075000000000088 | 7.956 | -1.344 | -2.644 |
| -1.070000000000088 | 7.925 | -1.355 | -2.635 |
| -1.065000000000088 | 7.894 | -1.366 | -2.626 |
| -1.060000000000088 | 7.864 | -1.376 | -2.616 |
| -1.055000000000089 | 7.833 | -1.387 | -2.607 |
| -1.050000000000089 | 7.803 | -1.397 | -2.598 |
| -1.045000000000089 | 7.772 | -1.408 | -2.588 |
| -1.040000000000089 | 7.742 | -1.418 | -2.578 |
| -1.035000000000089 | 7.711 | -1.429 | -2.569 |
| -1.03000000000009 | 7.681 | -1.439 | -2.559 |
| -1.025000000000089 | 7.651 | -1.449 | -2.549 |
| -1.020000000000089 | 7.62 | -1.46 | -2.54 |
| -1.015000000000089 | 7.59 | -1.47 | -2.53 |
| -1.010000000000089 | 7.56 | -1.48 | -2.52 |
| -1.00500000000009 | 7.53 | -1.49 | -2.51 |
| -1.00000000000009 | 7.5 | -1.5 | -2.5 |
| -0.99500000000009 | 7.47 | -1.51 | -2.49 |
| -0.99000000000009 | 7.44 | -1.52 | -2.48 |
| -0.98500000000009 | 7.41 | -1.53 | -2.47 |
| -0.98000000000009 | 7.38 | -1.54 | -2.46 |
| -0.97500000000009 | 7.351 | -1.549 | -2.449 |
| -0.97000000000009 | 7.321 | -1.559 | -2.439 |
| -0.96500000000009 | 7.291 | -1.569 | -2.429 |
| -0.96000000000009 | 7.262 | -1.578 | -2.418 |
| -0.95500000000009 | 7.232 | -1.588 | -2.408 |
| -0.95000000000009 | 7.203 | -1.597 | -2.398 |
| -0.94500000000009 | 7.173 | -1.607 | -2.387 |
| -0.94000000000009 | 7.144 | -1.616 | -2.376 |
| -0.93500000000009 | 7.114 | -1.626 | -2.366 |
| -0.93000000000009 | 7.085 | -1.635 | -2.355 |
| -0.92500000000009 | 7.056 | -1.644 | -2.344 |
| -0.92000000000009 | 7.026 | -1.654 | -2.334 |
| -0.91500000000009 | 6.997 | -1.663 | -2.323 |
| -0.91000000000009 | 6.968 | -1.672 | -2.312 |
| -0.90500000000009 | 6.939 | -1.681 | -2.301 |
| -0.90000000000009 | 6.91 | -1.69 | -2.29 |
| -0.89500000000009 | 6.881 | -1.699 | -2.279 |
| -0.89000000000009 | 6.852 | -1.708 | -2.268 |
| -0.88500000000009 | 6.823 | -1.717 | -2.257 |
| -0.88000000000009 | 6.794 | -1.726 | -2.246 |
| -0.87500000000009 | 6.766 | -1.734 | -2.234 |
| -0.87000000000009 | 6.737 | -1.743 | -2.223 |
| -0.86500000000009 | 6.708 | -1.752 | -2.212 |
| -0.86000000000009 | 6.68 | -1.76 | -2.2 |
| -0.85500000000009 | 6.651 | -1.769 | -2.189 |
| -0.85000000000009 | 6.623 | -1.777 | -2.178 |
| -0.84500000000009 | 6.594 | -1.786 | -2.166 |
| -0.84000000000009 | 6.566 | -1.794 | -2.154 |
| -0.83500000000009 | 6.537 | -1.803 | -2.143 |
| -0.83000000000009 | 6.509 | -1.811 | -2.131 |
| -0.82500000000009 | 6.481 | -1.819 | -2.119 |
| -0.820000000000089 | 6.452 | -1.828 | -2.108 |
| -0.815000000000089 | 6.424 | -1.836 | -2.096 |
| -0.810000000000089 | 6.396 | -1.844 | -2.084 |
| -0.805000000000089 | 6.368 | -1.852 | -2.072 |
| -0.800000000000089 | 6.34 | -1.86 | -2.06 |
| -0.795000000000089 | 6.312 | -1.868 | -2.048 |
| -0.790000000000089 | 6.284 | -1.876 | -2.036 |
| -0.785000000000089 | 6.256 | -1.884 | -2.024 |
| -0.780000000000089 | 6.228 | -1.892 | -2.012 |
| -0.775000000000089 | 6.201 | -1.899 | -1.999 |
| -0.770000000000089 | 6.173 | -1.907 | -1.987 |
| -0.765000000000089 | 6.145 | -1.915 | -1.975 |
| -0.760000000000089 | 6.118 | -1.922 | -1.962 |
| -0.755000000000089 | 6.09 | -1.93 | -1.95 |
| -0.750000000000089 | 6.063 | -1.937 | -1.938 |
| -0.745000000000089 | 6.035 | -1.945 | -1.925 |
| -0.740000000000089 | 6.008 | -1.952 | -1.912 |
| -0.735000000000089 | 5.98 | -1.96 | -1.9 |
| -0.730000000000089 | 5.953 | -1.967 | -1.887 |
| -0.725000000000089 | 5.926 | -1.974 | -1.874 |
| -0.720000000000089 | 5.898 | -1.982 | -1.862 |
| -0.715000000000089 | 5.871 | -1.989 | -1.849 |
| -0.710000000000089 | 5.844 | -1.996 | -1.836 |
| -0.705000000000089 | 5.817 | -2.003 | -1.823 |
| -0.700000000000089 | 5.79 | -2.01 | -1.81 |
| -0.695000000000089 | 5.763 | -2.017 | -1.797 |
| -0.690000000000089 | 5.736 | -2.024 | -1.784 |
| -0.685000000000089 | 5.709 | -2.031 | -1.771 |
| -0.680000000000089 | 5.682 | -2.038 | -1.758 |
| -0.675000000000089 | 5.656 | -2.044 | -1.744 |
| -0.670000000000089 | 5.629 | -2.051 | -1.731 |
| -0.665000000000089 | 5.602 | -2.058 | -1.718 |
| -0.660000000000089 | 5.576 | -2.064 | -1.704 |
| -0.655000000000089 | 5.549 | -2.071 | -1.691 |
| -0.650000000000089 | 5.523 | -2.077 | -1.678 |
| -0.645000000000089 | 5.496 | -2.084 | -1.664 |
| -0.640000000000089 | 5.47 | -2.09 | -1.65 |
| -0.635000000000089 | 5.443 | -2.097 | -1.637 |
| -0.630000000000089 | 5.417 | -2.103 | -1.623 |
| -0.625000000000089 | 5.391 | -2.109 | -1.609 |
| -0.620000000000089 | 5.364 | -2.116 | -1.596 |
| -0.615000000000089 | 5.338 | -2.122 | -1.582 |
| -0.610000000000089 | 5.312 | -2.128 | -1.568 |
| -0.605000000000089 | 5.286 | -2.134 | -1.554 |
| -0.600000000000089 | 5.26 | -2.14 | -1.54 |
| -0.595000000000089 | 5.234 | -2.146 | -1.526 |
| -0.590000000000089 | 5.208 | -2.152 | -1.512 |
| -0.585000000000089 | 5.182 | -2.158 | -1.498 |
| -0.580000000000089 | 5.156 | -2.164 | -1.484 |
| -0.575000000000089 | 5.131 | -2.169 | -1.469 |
| -0.570000000000089 | 5.105 | -2.175 | -1.455 |
| -0.565000000000089 | 5.079 | -2.181 | -1.441 |
| -0.560000000000089 | 5.054 | -2.186 | -1.426 |
| -0.555000000000089 | 5.028 | -2.192 | -1.412 |
| -0.550000000000089 | 5.003 | -2.197 | -1.398 |
| -0.545000000000089 | 4.977 | -2.203 | -1.383 |
| -0.540000000000089 | 4.952 | -2.208 | -1.368 |
| -0.535000000000089 | 4.926 | -2.214 | -1.354 |
| -0.530000000000089 | 4.901 | -2.219 | -1.339 |
| -0.525000000000089 | 4.876 | -2.224 | -1.324 |
| -0.520000000000089 | 4.85 | -2.23 | -1.31 |
| -0.515000000000089 | 4.825 | -2.235 | -1.295 |
| -0.510000000000089 | 4.8 | -2.24 | -1.28 |
| -0.505000000000089 | 4.775 | -2.245 | -1.265 |
| -0.500000000000089 | 4.75 | -2.25 | -1.25 |
| -0.495000000000089 | 4.725 | -2.255 | -1.235 |
| -0.490000000000089 | 4.7 | -2.26 | -1.22 |
| -0.485000000000089 | 4.675 | -2.265 | -1.205 |
| -0.480000000000089 | 4.65 | -2.27 | -1.19 |
| -0.475000000000089 | 4.626 | -2.274 | -1.174 |
| -0.470000000000089 | 4.601 | -2.279 | -1.159 |
| -0.465000000000089 | 4.576 | -2.284 | -1.144 |
| -0.460000000000089 | 4.552 | -2.288 | -1.128 |
| -0.455000000000089 | 4.527 | -2.293 | -1.113 |
| -0.450000000000089 | 4.503 | -2.297 | -1.098 |
| -0.445000000000089 | 4.478 | -2.302 | -1.082 |
| -0.440000000000089 | 4.454 | -2.306 | -1.066 |
| -0.435000000000089 | 4.429 | -2.311 | -1.051 |
| -0.430000000000089 | 4.405 | -2.315 | -1.035 |
| -0.425000000000089 | 4.381 | -2.319 | -1.019 |
| -0.420000000000089 | 4.356 | -2.324 | -1.004 |
| -0.415000000000089 | 4.332 | -2.328 | -0.988 |
| -0.410000000000089 | 4.308 | -2.332 | -0.972 |
| -0.405000000000089 | 4.284 | -2.336 | -0.956 |
| -0.400000000000089 | 4.26 | -2.34 | -0.94 |
| -0.395000000000089 | 4.236 | -2.344 | -0.924 |
| -0.390000000000089 | 4.212 | -2.348 | -0.908 |
| -0.385000000000089 | 4.188 | -2.352 | -0.892 |
| -0.380000000000089 | 4.164 | -2.356 | -0.876 |
| -0.375000000000089 | 4.141 | -2.359 | -0.859 |
| -0.370000000000089 | 4.117 | -2.363 | -0.843 |
| -0.365000000000089 | 4.093 | -2.367 | -0.827 |
| -0.360000000000089 | 4.07 | -2.37 | -0.81 |
| -0.355000000000089 | 4.046 | -2.374 | -0.794 |
| -0.350000000000089 | 4.023 | -2.377 | -0.778 |
| -0.345000000000089 | 3.999 | -2.381 | -0.761 |
| -0.340000000000089 | 3.976 | -2.384 | -0.744 |
| -0.335000000000089 | 3.952 | -2.388 | -0.728 |
| -0.330000000000089 | 3.929 | -2.391 | -0.711 |
| -0.325000000000089 | 3.906 | -2.394 | -0.694 |
| -0.320000000000089 | 3.882 | -2.398 | -0.678 |
| -0.315000000000089 | 3.859 | -2.401 | -0.661 |
| -0.310000000000089 | 3.836 | -2.404 | -0.644 |
| -0.305000000000089 | 3.813 | -2.407 | -0.627 |
| -0.300000000000089 | 3.79 | -2.41 | -0.61 |
| -0.295000000000089 | 3.767 | -2.413 | -0.593 |
| -0.290000000000089 | 3.744 | -2.416 | -0.576 |
| -0.285000000000089 | 3.721 | -2.419 | -0.559 |
| -0.280000000000089 | 3.698 | -2.422 | -0.542 |
| -0.275000000000089 | 3.676 | -2.424 | -0.524 |
| -0.270000000000089 | 3.653 | -2.427 | -0.507 |
| -0.265000000000089 | 3.63 | -2.43 | -0.49 |
| -0.260000000000089 | 3.608 | -2.432 | -0.472 |
| -0.255000000000089 | 3.585 | -2.435 | -0.455 |
| -0.250000000000089 | 3.563 | -2.437 | -0.438 |
| -0.245000000000089 | 3.54 | -2.44 | -0.42 |
| -0.240000000000089 | 3.518 | -2.442 | -0.402 |
| -0.235000000000089 | 3.495 | -2.445 | -0.385 |
| -0.230000000000089 | 3.473 | -2.447 | -0.367 |
| -0.225000000000089 | 3.451 | -2.449 | -0.349 |
| -0.220000000000089 | 3.428 | -2.452 | -0.332 |
| -0.215000000000089 | 3.406 | -2.454 | -0.314 |
| -0.210000000000089 | 3.384 | -2.456 | -0.296 |
| -0.205000000000089 | 3.362 | -2.458 | -0.278 |
| -0.200000000000089 | 3.34 | -2.46 | -0.26 |
| -0.195000000000089 | 3.318 | -2.462 | -0.242 |
| -0.190000000000089 | 3.296 | -2.464 | -0.224 |
| -0.185000000000089 | 3.274 | -2.466 | -0.206 |
| -0.180000000000089 | 3.252 | -2.468 | -0.188 |
| -0.175000000000089 | 3.231 | -2.469 | -0.169 |
| -0.170000000000089 | 3.209 | -2.471 | -0.151 |
| -0.165000000000089 | 3.187 | -2.473 | -0.133 |
| -0.160000000000089 | 3.166 | -2.474 | -0.114 |
| -0.155000000000089 | 3.144 | -2.476 | -0.096 |
| -0.150000000000089 | 3.123 | -2.477 | -0.078 |
| -0.145000000000089 | 3.101 | -2.479 | -0.059 |
| -0.140000000000089 | 3.08 | -2.48 | -0.04 |
| -0.135000000000089 | 3.058 | -2.482 | -0.022 |
| -0.130000000000089 | 3.037 | -2.483 | -0.003 |
| -0.125000000000089 | 3.016 | -2.484 | 0.016 |
| -0.120000000000089 | 2.994 | -2.486 | 0.034 |
| -0.115000000000089 | 2.973 | -2.487 | 0.053 |
| -0.110000000000089 | 2.952 | -2.488 | 0.072 |
| -0.105000000000089 | 2.931 | -2.489 | 0.091 |
| -0.100000000000089 | 2.91 | -2.49 | 0.11 |
| -0.0950000000000889 | 2.889 | -2.491 | 0.129 |
| -0.0900000000000889 | 2.868 | -2.492 | 0.148 |
| -0.0850000000000889 | 2.847 | -2.493 | 0.167 |
| -0.0800000000000889 | 2.826 | -2.494 | 0.186 |
| -0.0750000000000889 | 2.806 | -2.494 | 0.206 |
| -0.0700000000000889 | 2.785 | -2.495 | 0.225 |
| -0.0650000000000889 | 2.764 | -2.496 | 0.244 |
| -0.0600000000000889 | 2.744 | -2.496 | 0.264 |
| -0.0550000000000889 | 2.723 | -2.497 | 0.283 |
| -0.0500000000000889 | 2.703 | -2.497 | 0.302 |
| -0.0450000000000889 | 2.682 | -2.498 | 0.322 |
| -0.0400000000000889 | 2.662 | -2.498 | 0.342 |
| -0.0350000000000889 | 2.641 | -2.499 | 0.361 |
| -0.0300000000000889 | 2.621 | -2.499 | 0.381 |
| -0.0250000000000889 | 2.601 | -2.499 | 0.401 |
| -0.0200000000000889 | 2.58 | -2.5 | 0.42 |
| -0.0150000000000889 | 2.56 | -2.5 | 0.44 |
| -0.0100000000000889 | 2.54 | -2.5 | 0.46 |
| -0.00500000000008888 | 2.52 | -2.5 | 0.48 |
| -8.88854961855756e-14 | 2.5 | -2.5 | 0.5 |
| 0.00499999999991111 | 2.48 | -2.5 | 0.52 |
| 0.00999999999991111 | 2.46 | -2.5 | 0.54 |
| 0.0149999999999111 | 2.44 | -2.5 | 0.56 |
| 0.0199999999999111 | 2.42 | -2.5 | 0.58 |
| 0.0249999999999111 | 2.401 | -2.499 | 0.601 |
| 0.0299999999999111 | 2.381 | -2.499 | 0.621 |
| 0.0349999999999111 | 2.361 | -2.499 | 0.641 |
| 0.0399999999999111 | 2.342 | -2.498 | 0.662 |
| 0.0449999999999111 | 2.322 | -2.498 | 0.682 |
| 0.0499999999999111 | 2.303 | -2.498 | 0.702 |
| 0.0549999999999111 | 2.283 | -2.497 | 0.723 |
| 0.0599999999999111 | 2.264 | -2.496 | 0.744 |
| 0.0649999999999111 | 2.244 | -2.496 | 0.764 |
| 0.0699999999999111 | 2.225 | -2.495 | 0.785 |
| 0.0749999999999111 | 2.206 | -2.494 | 0.806 |
| 0.0799999999999111 | 2.186 | -2.494 | 0.826 |
| 0.0849999999999111 | 2.167 | -2.493 | 0.847 |
| 0.0899999999999111 | 2.148 | -2.492 | 0.868 |
| 0.0949999999999111 | 2.129 | -2.491 | 0.889 |
| 0.0999999999999111 | 2.11 | -2.49 | 0.91 |
| 0.104999999999911 | 2.091 | -2.489 | 0.931 |
| 0.109999999999911 | 2.072 | -2.488 | 0.952 |
| 0.114999999999911 | 2.053 | -2.487 | 0.973 |
| 0.119999999999911 | 2.034 | -2.486 | 0.994 |
| 0.124999999999911 | 2.016 | -2.484 | 1.016 |
| 0.129999999999911 | 1.997 | -2.483 | 1.037 |
| 0.134999999999911 | 1.978 | -2.482 | 1.058 |
| 0.139999999999911 | 1.96 | -2.48 | 1.08 |
| 0.144999999999911 | 1.941 | -2.479 | 1.101 |
| 0.149999999999911 | 1.923 | -2.478 | 1.122 |
| 0.154999999999911 | 1.904 | -2.476 | 1.144 |
| 0.159999999999911 | 1.886 | -2.474 | 1.166 |
| 0.164999999999911 | 1.867 | -2.473 | 1.187 |
| 0.169999999999911 | 1.849 | -2.471 | 1.209 |
| 0.174999999999911 | 1.831 | -2.469 | 1.231 |
| 0.179999999999911 | 1.812 | -2.468 | 1.252 |
| 0.184999999999911 | 1.794 | -2.466 | 1.274 |
| 0.189999999999911 | 1.776 | -2.464 | 1.296 |
| 0.194999999999911 | 1.758 | -2.462 | 1.318 |
| 0.199999999999911 | 1.74 | -2.46 | 1.34 |
| 0.204999999999911 | 1.722 | -2.458 | 1.362 |
| 0.209999999999911 | 1.704 | -2.456 | 1.384 |
| 0.214999999999911 | 1.686 | -2.454 | 1.406 |
| 0.219999999999911 | 1.668 | -2.452 | 1.428 |
| 0.224999999999911 | 1.651 | -2.449 | 1.451 |
| 0.229999999999911 | 1.633 | -2.447 | 1.473 |
| 0.234999999999911 | 1.615 | -2.445 | 1.495 |
| 0.239999999999911 | 1.598 | -2.442 | 1.518 |
| 0.244999999999911 | 1.58 | -2.44 | 1.54 |
| 0.249999999999911 | 1.563 | -2.438 | 1.562 |
| 0.254999999999911 | 1.545 | -2.435 | 1.585 |
| 0.259999999999911 | 1.528 | -2.432 | 1.608 |
| 0.264999999999911 | 1.51 | -2.43 | 1.63 |
| 0.269999999999911 | 1.493 | -2.427 | 1.653 |
| 0.274999999999911 | 1.476 | -2.424 | 1.676 |
| 0.279999999999911 | 1.458 | -2.422 | 1.698 |
| 0.284999999999911 | 1.441 | -2.419 | 1.721 |
| 0.289999999999911 | 1.424 | -2.416 | 1.744 |
| 0.294999999999911 | 1.407 | -2.413 | 1.767 |
| 0.299999999999911 | 1.39 | -2.41 | 1.79 |
| 0.304999999999911 | 1.373 | -2.407 | 1.813 |
| 0.309999999999911 | 1.356 | -2.404 | 1.836 |
| 0.314999999999911 | 1.339 | -2.401 | 1.859 |
| 0.319999999999911 | 1.322 | -2.398 | 1.882 |
| 0.324999999999911 | 1.306 | -2.394 | 1.906 |
| 0.329999999999911 | 1.289 | -2.391 | 1.929 |
| 0.334999999999911 | 1.272 | -2.388 | 1.952 |
| 0.339999999999911 | 1.256 | -2.384 | 1.976 |
| 0.344999999999911 | 1.239 | -2.381 | 1.999 |
| 0.349999999999911 | 1.223 | -2.378 | 2.022 |
| 0.354999999999911 | 1.206 | -2.374 | 2.046 |
| 0.359999999999911 | 1.19 | -2.37 | 2.07 |
| 0.364999999999911 | 1.173 | -2.367 | 2.093 |
| 0.369999999999911 | 1.157 | -2.363 | 2.117 |
| 0.374999999999911 | 1.141 | -2.359 | 2.141 |
| 0.379999999999911 | 1.124 | -2.356 | 2.164 |
| 0.384999999999911 | 1.108 | -2.352 | 2.188 |
| 0.389999999999911 | 1.092 | -2.348 | 2.212 |
| 0.394999999999911 | 1.076 | -2.344 | 2.236 |
| 0.399999999999911 | 1.06 | -2.34 | 2.26 |
| 0.404999999999911 | 1.044 | -2.336 | 2.284 |
| 0.409999999999911 | 1.028 | -2.332 | 2.308 |
| 0.414999999999911 | 1.012 | -2.328 | 2.332 |
| 0.419999999999911 | 0.996 | -2.324 | 2.356 |
| 0.424999999999911 | 0.981 | -2.319 | 2.381 |
| 0.429999999999911 | 0.965 | -2.315 | 2.405 |
| 0.434999999999911 | 0.949 | -2.311 | 2.429 |
| 0.439999999999911 | 0.934 | -2.306 | 2.454 |
| 0.444999999999911 | 0.918 | -2.302 | 2.478 |
| 0.449999999999911 | 0.903 | -2.298 | 2.502 |
| 0.454999999999911 | 0.887 | -2.293 | 2.527 |
| 0.459999999999911 | 0.872 | -2.288 | 2.552 |
| 0.464999999999911 | 0.856 | -2.284 | 2.576 |
| 0.469999999999911 | 0.841 | -2.279 | 2.601 |
| 0.474999999999911 | 0.826 | -2.274 | 2.626 |
| 0.479999999999911 | 0.81 | -2.27 | 2.65 |
| 0.484999999999911 | 0.795 | -2.265 | 2.675 |
| 0.489999999999911 | 0.78 | -2.26 | 2.7 |
| 0.494999999999911 | 0.765 | -2.255 | 2.725 |
| 0.499999999999911 | 0.75 | -2.25 | 2.75 |
| 0.504999999999911 | 0.735 | -2.245 | 2.775 |
| 0.509999999999911 | 0.72 | -2.24 | 2.8 |
| 0.514999999999911 | 0.705 | -2.235 | 2.825 |
| 0.519999999999911 | 0.69 | -2.23 | 2.85 |
| 0.524999999999911 | 0.676 | -2.224 | 2.876 |
| 0.529999999999911 | 0.661 | -2.219 | 2.901 |
| 0.534999999999911 | 0.646 | -2.214 | 2.926 |
| 0.539999999999911 | 0.632 | -2.208 | 2.952 |
| 0.544999999999911 | 0.617 | -2.203 | 2.977 |
| 0.549999999999911 | 0.603 | -2.198 | 3.002 |
| 0.554999999999911 | 0.588 | -2.192 | 3.028 |
| 0.559999999999911 | 0.574 | -2.186 | 3.054 |
| 0.564999999999911 | 0.559 | -2.181 | 3.079 |
| 0.569999999999911 | 0.545 | -2.175 | 3.105 |
| 0.574999999999911 | 0.531 | -2.169 | 3.131 |
| 0.579999999999911 | 0.516 | -2.164 | 3.156 |
| 0.584999999999911 | 0.502 | -2.158 | 3.182 |
| 0.589999999999911 | 0.488 | -2.152 | 3.208 |
| 0.594999999999911 | 0.474 | -2.146 | 3.234 |
| 0.599999999999911 | 0.46 | -2.14 | 3.26 |
| 0.604999999999911 | 0.446 | -2.134 | 3.286 |
| 0.609999999999911 | 0.432 | -2.128 | 3.312 |
| 0.614999999999911 | 0.418 | -2.122 | 3.338 |
| 0.619999999999911 | 0.404 | -2.116 | 3.364 |
| 0.624999999999911 | 0.391 | -2.109 | 3.391 |
| 0.629999999999911 | 0.377 | -2.103 | 3.417 |
| 0.634999999999911 | 0.363 | -2.097 | 3.443 |
| 0.639999999999911 | 0.35 | -2.09 | 3.47 |
| 0.644999999999911 | 0.336 | -2.084 | 3.496 |
| 0.649999999999911 | 0.323 | -2.078 | 3.522 |
| 0.654999999999911 | 0.309 | -2.071 | 3.549 |
| 0.659999999999911 | 0.296 | -2.064 | 3.576 |
| 0.664999999999911 | 0.282 | -2.058 | 3.602 |
| 0.669999999999911 | 0.269 | -2.051 | 3.629 |
| 0.674999999999911 | 0.256 | -2.044 | 3.656 |
| 0.679999999999911 | 0.242 | -2.038 | 3.682 |
| 0.684999999999911 | 0.229 | -2.031 | 3.709 |
| 0.689999999999911 | 0.216 | -2.024 | 3.736 |
| 0.694999999999911 | 0.203 | -2.017 | 3.763 |
| 0.699999999999911 | 0.19 | -2.01 | 3.79 |
| 0.704999999999912 | 0.177 | -2.003 | 3.817 |
| 0.709999999999912 | 0.164 | -1.996 | 3.844 |
| 0.714999999999912 | 0.151 | -1.989 | 3.871 |
| 0.719999999999912 | 0.138 | -1.982 | 3.898 |
| 0.724999999999912 | 0.126 | -1.974 | 3.926 |
| 0.729999999999912 | 0.113 | -1.967 | 3.953 |
| 0.734999999999912 | 0.1 | -1.96 | 3.98 |
| 0.739999999999912 | 0.088 | -1.952 | 4.008 |
| 0.744999999999912 | 0.075 | -1.945 | 4.035 |
| 0.749999999999912 | 0.063 | -1.938 | 4.062 |
| 0.754999999999912 | 0.05 | -1.93 | 4.09 |
| 0.759999999999912 | 0.038 | -1.922 | 4.118 |
| 0.764999999999912 | 0.025 | -1.915 | 4.145 |
| 0.769999999999912 | 0.013 | -1.907 | 4.173 |
| 0.774999999999912 | 0.001 | -1.899 | 4.201 |
| 0.779999999999912 | -0.012 | -1.892 | 4.228 |
| 0.784999999999912 | -0.024 | -1.884 | 4.256 |
| 0.789999999999912 | -0.036 | -1.876 | 4.284 |
| 0.794999999999912 | -0.048 | -1.868 | 4.312 |
| 0.799999999999912 | -0.06 | -1.86 | 4.34 |
| 0.804999999999912 | -0.072 | -1.852 | 4.368 |
| 0.809999999999912 | -0.084 | -1.844 | 4.396 |
| 0.814999999999912 | -0.096 | -1.836 | 4.424 |
| 0.819999999999912 | -0.108 | -1.828 | 4.452 |
| 0.824999999999912 | -0.119 | -1.819 | 4.481 |
| 0.829999999999912 | -0.131 | -1.811 | 4.509 |
| 0.834999999999912 | -0.143 | -1.803 | 4.537 |
| 0.839999999999912 | -0.154 | -1.794 | 4.566 |
| 0.844999999999912 | -0.166 | -1.786 | 4.594 |
| 0.849999999999912 | -0.177 | -1.778 | 4.622 |
| 0.854999999999912 | -0.189 | -1.769 | 4.651 |
| 0.859999999999912 | -0.2 | -1.76 | 4.68 |
| 0.864999999999912 | -0.212 | -1.752 | 4.708 |
| 0.869999999999912 | -0.223 | -1.743 | 4.737 |
| 0.874999999999912 | -0.234 | -1.734 | 4.766 |
| 0.879999999999912 | -0.246 | -1.726 | 4.794 |
| 0.884999999999912 | -0.257 | -1.717 | 4.823 |
| 0.889999999999912 | -0.268 | -1.708 | 4.852 |
| 0.894999999999912 | -0.279 | -1.699 | 4.881 |
| 0.899999999999912 | -0.29 | -1.69 | 4.91 |
| 0.904999999999912 | -0.301 | -1.681 | 4.939 |
| 0.909999999999912 | -0.312 | -1.672 | 4.968 |
| 0.914999999999912 | -0.323 | -1.663 | 4.997 |
| 0.919999999999912 | -0.334 | -1.654 | 5.026 |
| 0.924999999999912 | -0.344 | -1.644 | 5.056 |
| 0.929999999999912 | -0.355 | -1.635 | 5.085 |
| 0.934999999999912 | -0.366 | -1.626 | 5.114 |
| 0.939999999999912 | -0.376 | -1.616 | 5.144 |
| 0.944999999999912 | -0.387 | -1.607 | 5.173 |
| 0.949999999999912 | -0.397 | -1.598 | 5.202 |
| 0.954999999999912 | -0.408 | -1.588 | 5.232 |
| 0.959999999999912 | -0.418 | -1.578 | 5.262 |
| 0.964999999999912 | -0.429 | -1.569 | 5.291 |
| 0.969999999999912 | -0.439 | -1.559 | 5.321 |
| 0.974999999999912 | -0.449 | -1.549 | 5.351 |
| 0.979999999999912 | -0.46 | -1.54 | 5.38 |
| 0.984999999999912 | -0.47 | -1.53 | 5.41 |
| 0.989999999999912 | -0.48 | -1.52 | 5.44 |
| 0.994999999999912 | -0.49 | -1.51 | 5.47 |
| 0.999999999999912 | -0.5 | -1.5 | 5.5 |
| 1.004999999999912 | -0.51 | -1.49 | 5.53 |
| 1.009999999999912 | -0.52 | -1.48 | 5.56 |
| 1.014999999999912 | -0.53 | -1.47 | 5.59 |
| 1.019999999999911 | -0.54 | -1.46 | 5.62 |
| 1.024999999999911 | -0.549 | -1.449 | 5.651 |
| 1.029999999999911 | -0.559 | -1.439 | 5.681 |
| 1.034999999999911 | -0.569 | -1.429 | 5.711 |
| 1.039999999999911 | -0.578 | -1.418 | 5.742 |
| 1.044999999999911 | -0.588 | -1.408 | 5.772 |
| 1.049999999999911 | -0.597 | -1.398 | 5.802 |
| 1.054999999999911 | -0.607 | -1.387 | 5.833 |
| 1.059999999999911 | -0.616 | -1.376 | 5.864 |
| 1.06499999999991 | -0.626 | -1.366 | 5.894 |
| 1.06999999999991 | -0.635 | -1.355 | 5.925 |
| 1.07499999999991 | -0.644 | -1.344 | 5.956 |
| 1.07999999999991 | -0.654 | -1.334 | 5.986 |
| 1.08499999999991 | -0.663 | -1.323 | 6.017 |
| 1.08999999999991 | -0.672 | -1.312 | 6.048 |
| 1.09499999999991 | -0.681 | -1.301 | 6.079 |
| 1.09999999999991 | -0.69 | -1.29 | 6.11 |
| 1.10499999999991 | -0.699 | -1.279 | 6.141 |
| 1.109999999999909 | -0.708 | -1.268 | 6.172 |
| 1.114999999999909 | -0.717 | -1.257 | 6.203 |
| 1.119999999999909 | -0.726 | -1.246 | 6.234 |
| 1.124999999999909 | -0.734 | -1.234 | 6.266 |
| 1.129999999999909 | -0.743 | -1.223 | 6.297 |
| 1.134999999999909 | -0.752 | -1.212 | 6.328 |
| 1.139999999999909 | -0.76 | -1.2 | 6.36 |
| 1.144999999999909 | -0.769 | -1.189 | 6.391 |
| 1.149999999999909 | -0.777 | -1.178 | 6.422 |
| 1.154999999999909 | -0.786 | -1.166 | 6.454 |
| 1.159999999999908 | -0.794 | -1.154 | 6.486 |
| 1.164999999999908 | -0.803 | -1.143 | 6.517 |
| 1.169999999999908 | -0.811 | -1.131 | 6.549 |
| 1.174999999999908 | -0.819 | -1.119 | 6.581 |
| 1.179999999999908 | -0.828 | -1.108 | 6.612 |
| 1.184999999999908 | -0.836 | -1.096 | 6.644 |
| 1.189999999999908 | -0.844 | -1.084 | 6.676 |
| 1.194999999999908 | -0.852 | -1.072 | 6.708 |
| 1.199999999999908 | -0.86 | -1.06 | 6.74 |
| 1.204999999999907 | -0.868 | -1.048 | 6.772 |
| 1.209999999999907 | -0.876 | -1.036 | 6.804 |
| 1.214999999999907 | -0.884 | -1.024 | 6.836 |
| 1.219999999999907 | -0.892 | -1.012 | 6.868 |
| 1.224999999999907 | -0.899 | -0.999 | 6.901 |
| 1.229999999999907 | -0.907 | -0.987 | 6.933 |
| 1.234999999999907 | -0.915 | -0.975 | 6.965 |
| 1.239999999999907 | -0.922 | -0.962 | 6.998 |
| 1.244999999999907 | -0.93 | -0.95 | 7.03 |
| 1.249999999999906 | -0.937 | -0.938 | 7.062 |
| 1.254999999999906 | -0.945 | -0.925 | 7.095 |
| 1.259999999999906 | -0.952 | -0.912 | 7.128 |
| 1.264999999999906 | -0.96 | -0.9 | 7.16 |
| 1.269999999999906 | -0.967 | -0.887 | 7.193 |
| 1.274999999999906 | -0.974 | -0.874 | 7.226 |
| 1.279999999999906 | -0.982 | -0.862 | 7.258 |
| 1.284999999999906 | -0.989 | -0.849 | 7.291 |
| 1.289999999999906 | -0.996 | -0.836 | 7.324 |
| 1.294999999999906 | -1.003 | -0.823 | 7.357 |
| 1.299999999999905 | -1.01 | -0.81 | 7.39 |
| 1.304999999999905 | -1.017 | -0.797 | 7.423 |
| 1.309999999999905 | -1.024 | -0.784 | 7.456 |
| 1.314999999999905 | -1.031 | -0.771 | 7.489 |
| 1.319999999999905 | -1.038 | -0.758 | 7.522 |
| 1.324999999999905 | -1.044 | -0.744 | 7.556 |
| 1.329999999999905 | -1.051 | -0.731 | 7.589 |
| 1.334999999999905 | -1.058 | -0.718 | 7.622 |
| 1.339999999999905 | -1.064 | -0.704 | 7.656 |
| 1.344999999999904 | -1.071 | -0.691 | 7.689 |
| 1.349999999999904 | -1.077 | -0.678 | 7.722 |
| 1.354999999999904 | -1.084 | -0.664 | 7.756 |
| 1.359999999999904 | -1.09 | -0.65 | 7.79 |
| 1.364999999999904 | -1.097 | -0.637 | 7.823 |
| 1.369999999999904 | -1.103 | -0.623 | 7.857 |
| 1.374999999999904 | -1.109 | -0.609 | 7.891 |
| 1.379999999999904 | -1.116 | -0.596 | 7.924 |
| 1.384999999999904 | -1.122 | -0.582 | 7.958 |
| 1.389999999999903 | -1.128 | -0.568 | 7.992 |
| 1.394999999999903 | -1.134 | -0.554 | 8.026 |
| 1.399999999999903 | -1.14 | -0.54 | 8.06 |
| 1.404999999999903 | -1.146 | -0.526 | 8.094 |
| 1.409999999999903 | -1.152 | -0.512 | 8.128 |
| 1.414999999999903 | -1.158 | -0.498 | 8.162 |
| 1.419999999999903 | -1.164 | -0.484 | 8.196 |
| 1.424999999999903 | -1.169 | -0.469 | 8.231 |
| 1.429999999999903 | -1.175 | -0.455 | 8.265 |
| 1.434999999999903 | -1.181 | -0.441 | 8.299 |
| 1.439999999999902 | -1.186 | -0.426 | 8.334 |
| 1.444999999999902 | -1.192 | -0.412 | 8.368 |
| 1.449999999999902 | -1.197 | -0.398 | 8.402 |
| 1.454999999999902 | -1.203 | -0.383 | 8.437 |
| 1.459999999999902 | -1.208 | -0.368 | 8.472 |
| 1.464999999999902 | -1.214 | -0.354 | 8.506 |
| 1.469999999999902 | -1.219 | -0.339 | 8.541 |
| 1.474999999999902 | -1.224 | -0.324 | 8.576 |
| 1.479999999999902 | -1.23 | -0.31 | 8.61 |
| 1.484999999999901 | -1.235 | -0.295 | 8.645 |
| 1.489999999999901 | -1.24 | -0.28 | 8.68 |
| 1.494999999999901 | -1.245 | -0.265 | 8.715 |
| 1.499999999999901 | -1.25 | -0.25 | 8.75 |
| 1.504999999999901 | -1.255 | -0.235 | 8.785 |
| 1.509999999999901 | -1.26 | -0.22 | 8.82 |
| 1.514999999999901 | -1.265 | -0.205 | 8.855 |
| 1.519999999999901 | -1.27 | -0.19 | 8.89 |
| 1.524999999999901 | -1.274 | -0.174 | 8.926 |
| 1.529999999999901 | -1.279 | -0.159 | 8.961 |
| 1.5349999999999 | -1.284 | -0.144 | 8.996 |
| 1.5399999999999 | -1.288 | -0.128 | 9.032 |
| 1.5449999999999 | -1.293 | -0.113 | 9.067 |
| 1.5499999999999 | -1.297 | -0.098 | 9.102 |
| 1.5549999999999 | -1.302 | -0.082 | 9.138 |
| 1.5599999999999 | -1.306 | -0.066 | 9.174 |
| 1.5649999999999 | -1.311 | -0.051 | 9.209 |
| 1.5699999999999 | -1.315 | -0.035 | 9.245 |
| 1.5749999999999 | -1.319 | -0.019 | 9.281 |
| 1.579999999999899 | -1.324 | -0.004 | 9.316 |
| 1.584999999999899 | -1.328 | 0.012 | 9.352 |
| 1.589999999999899 | -1.332 | 0.028 | 9.388 |
| 1.594999999999899 | -1.336 | 0.044 | 9.424 |
| 1.599999999999899 | -1.34 | 0.06 | 9.46 |
| 1.604999999999899 | -1.344 | 0.076 | 9.496 |
| 1.609999999999899 | -1.348 | 0.092 | 9.532 |
| 1.614999999999899 | -1.352 | 0.108 | 9.568 |
| 1.619999999999899 | -1.356 | 0.124 | 9.604 |
| 1.624999999999898 | -1.359 | 0.141 | 9.641 |
| 1.629999999999898 | -1.363 | 0.157 | 9.677 |
| 1.634999999999898 | -1.367 | 0.173 | 9.713 |
| 1.639999999999898 | -1.37 | 0.19 | 9.75 |
| 1.644999999999898 | -1.374 | 0.206 | 9.786 |
| 1.649999999999898 | -1.377 | 0.222 | 9.822 |
| 1.654999999999898 | -1.381 | 0.239 | 9.859 |
| 1.659999999999898 | -1.384 | 0.256 | 9.896 |
| 1.664999999999898 | -1.388 | 0.272 | 9.932 |
| 1.669999999999897 | -1.391 | 0.289 | 9.969 |
| 1.674999999999897 | -1.394 | 0.306 | 10.006 |
| 1.679999999999897 | -1.398 | 0.322 | 10.042 |
| 1.684999999999897 | -1.401 | 0.339 | 10.079 |
| 1.689999999999897 | -1.404 | 0.356 | 10.116 |
| 1.694999999999897 | -1.407 | 0.373 | 10.153 |
| 1.699999999999897 | -1.41 | 0.39 | 10.19 |
| 1.704999999999897 | -1.413 | 0.407 | 10.227 |
| 1.709999999999897 | -1.416 | 0.424 | 10.264 |
| 1.714999999999897 | -1.419 | 0.441 | 10.301 |
| 1.719999999999896 | -1.422 | 0.458 | 10.338 |
| 1.724999999999896 | -1.424 | 0.476 | 10.376 |
| 1.729999999999896 | -1.427 | 0.493 | 10.413 |
| 1.734999999999896 | -1.43 | 0.51 | 10.45 |
| 1.739999999999896 | -1.432 | 0.528 | 10.488 |
| 1.744999999999896 | -1.435 | 0.545 | 10.525 |
| 1.749999999999896 | -1.437 | 0.562 | 10.562 |
| 1.754999999999896 | -1.44 | 0.58 | 10.6 |
| 1.759999999999896 | -1.442 | 0.598 | 10.638 |
| 1.764999999999895 | -1.445 | 0.615 | 10.675 |
| 1.769999999999895 | -1.447 | 0.633 | 10.713 |
| 1.774999999999895 | -1.449 | 0.651 | 10.751 |
| 1.779999999999895 | -1.452 | 0.668 | 10.788 |
| 1.784999999999895 | -1.454 | 0.686 | 10.826 |
| 1.789999999999895 | -1.456 | 0.704 | 10.864 |
| 1.794999999999895 | -1.458 | 0.722 | 10.902 |
| 1.799999999999895 | -1.46 | 0.74 | 10.94 |
| 1.804999999999895 | -1.462 | 0.758 | 10.978 |
| 1.809999999999895 | -1.464 | 0.776 | 11.016 |
| 1.814999999999894 | -1.466 | 0.794 | 11.054 |
| 1.819999999999894 | -1.468 | 0.812 | 11.092 |
| 1.824999999999894 | -1.469 | 0.831 | 11.131 |
| 1.829999999999894 | -1.471 | 0.849 | 11.169 |
| 1.834999999999894 | -1.473 | 0.867 | 11.207 |
| 1.839999999999894 | -1.474 | 0.886 | 11.246 |
| 1.844999999999894 | -1.476 | 0.904 | 11.284 |
| 1.849999999999894 | -1.477 | 0.922 | 11.322 |
| 1.854999999999894 | -1.479 | 0.941 | 11.361 |
| 1.859999999999893 | -1.48 | 0.96 | 11.4 |
| 1.864999999999893 | -1.482 | 0.978 | 11.438 |
| 1.869999999999893 | -1.483 | 0.997 | 11.477 |
| 1.874999999999893 | -1.484 | 1.016 | 11.516 |
| 1.879999999999893 | -1.486 | 1.034 | 11.554 |
| 1.884999999999893 | -1.487 | 1.053 | 11.593 |
| 1.889999999999893 | -1.488 | 1.072 | 11.632 |
| 1.894999999999893 | -1.489 | 1.091 | 11.671 |
| 1.899999999999893 | -1.49 | 1.11 | 11.71 |
| 1.904999999999893 | -1.491 | 1.129 | 11.749 |
| 1.909999999999892 | -1.492 | 1.148 | 11.788 |
| 1.914999999999892 | -1.493 | 1.167 | 11.827 |
| 1.919999999999892 | -1.494 | 1.186 | 11.866 |
| 1.924999999999892 | -1.494 | 1.206 | 11.906 |
| 1.929999999999892 | -1.495 | 1.225 | 11.945 |
| 1.934999999999892 | -1.496 | 1.244 | 11.984 |
| 1.939999999999892 | -1.496 | 1.264 | 12.024 |
| 1.944999999999892 | -1.497 | 1.283 | 12.063 |
| 1.949999999999892 | -1.497 | 1.302 | 12.102 |
| 1.954999999999891 | -1.498 | 1.322 | 12.142 |
| 1.959999999999891 | -1.498 | 1.342 | 12.182 |
| 1.964999999999891 | -1.499 | 1.361 | 12.221 |
| 1.969999999999891 | -1.499 | 1.381 | 12.261 |
| 1.974999999999891 | -1.499 | 1.401 | 12.301 |
| 1.979999999999891 | -1.5 | 1.42 | 12.34 |
| 1.984999999999891 | -1.5 | 1.44 | 12.38 |
| 1.989999999999891 | -1.5 | 1.46 | 12.42 |
| 1.994999999999891 | -1.5 | 1.48 | 12.46 |
| 1.99999999999989 | -1.5 | 1.5 | 12.5 |
| 2.004999999999891 | -1.5 | 1.52 | 12.54 |
| 2.009999999999891 | -1.5 | 1.54 | 12.58 |
| 2.01499999999989 | -1.5 | 1.56 | 12.62 |
| 2.01999999999989 | -1.5 | 1.58 | 12.66 |
| 2.02499999999989 | -1.499 | 1.601 | 12.701 |
| 2.02999999999989 | -1.499 | 1.621 | 12.741 |
| 2.03499999999989 | -1.499 | 1.641 | 12.781 |
| 2.03999999999989 | -1.498 | 1.662 | 12.822 |
| 2.04499999999989 | -1.498 | 1.682 | 12.862 |
| 2.04999999999989 | -1.498 | 1.702 | 12.902 |
| 2.05499999999989 | -1.497 | 1.723 | 12.943 |
| 2.059999999999889 | -1.496 | 1.744 | 12.984 |
| 2.064999999999889 | -1.496 | 1.764 | 13.024 |
| 2.069999999999889 | -1.495 | 1.785 | 13.065 |
| 2.074999999999889 | -1.494 | 1.806 | 13.106 |
| 2.079999999999889 | -1.494 | 1.826 | 13.146 |
| 2.084999999999889 | -1.493 | 1.847 | 13.187 |
| 2.089999999999889 | -1.492 | 1.868 | 13.228 |
| 2.094999999999889 | -1.491 | 1.889 | 13.269 |
| 2.099999999999889 | -1.49 | 1.91 | 13.31 |
| 2.104999999999889 | -1.489 | 1.931 | 13.351 |
| 2.109999999999888 | -1.488 | 1.952 | 13.392 |
| 2.114999999999888 | -1.487 | 1.973 | 13.433 |
| 2.119999999999888 | -1.486 | 1.994 | 13.474 |
| 2.124999999999888 | -1.484 | 2.016 | 13.516 |
| 2.129999999999888 | -1.483 | 2.037 | 13.557 |
| 2.134999999999888 | -1.482 | 2.058 | 13.598 |
| 2.139999999999888 | -1.48 | 2.08 | 13.64 |
| 2.144999999999888 | -1.479 | 2.101 | 13.681 |
| 2.149999999999888 | -1.478 | 2.122 | 13.722 |
| 2.154999999999887 | -1.476 | 2.144 | 13.764 |
| 2.159999999999887 | -1.474 | 2.166 | 13.806 |
| 2.164999999999887 | -1.473 | 2.187 | 13.847 |
| 2.169999999999887 | -1.471 | 2.209 | 13.889 |
| 2.174999999999887 | -1.469 | 2.231 | 13.931 |
| 2.179999999999887 | -1.468 | 2.252 | 13.972 |
| 2.184999999999887 | -1.466 | 2.274 | 14.014 |
| 2.189999999999887 | -1.464 | 2.296 | 14.056 |
| 2.194999999999887 | -1.462 | 2.318 | 14.098 |
| 2.199999999999886 | -1.46 | 2.34 | 14.14 |
| 2.204999999999886 | -1.458 | 2.362 | 14.182 |
| 2.209999999999886 | -1.456 | 2.384 | 14.224 |
| 2.214999999999886 | -1.454 | 2.406 | 14.266 |
| 2.219999999999886 | -1.452 | 2.428 | 14.308 |
| 2.224999999999886 | -1.449 | 2.451 | 14.351 |
| 2.229999999999886 | -1.447 | 2.473 | 14.393 |
| 2.234999999999886 | -1.445 | 2.495 | 14.435 |
| 2.239999999999886 | -1.442 | 2.518 | 14.478 |
| 2.244999999999886 | -1.44 | 2.54 | 14.52 |
| 2.249999999999885 | -1.438 | 2.562 | 14.562 |
| 2.254999999999885 | -1.435 | 2.585 | 14.605 |
| 2.259999999999885 | -1.432 | 2.608 | 14.648 |
| 2.264999999999885 | -1.43 | 2.63 | 14.69 |
| 2.269999999999885 | -1.427 | 2.653 | 14.733 |
| 2.274999999999885 | -1.424 | 2.676 | 14.776 |
| 2.279999999999885 | -1.422 | 2.698 | 14.818 |
| 2.284999999999885 | -1.419 | 2.721 | 14.861 |
| 2.289999999999885 | -1.416 | 2.744 | 14.904 |
| 2.294999999999884 | -1.413 | 2.767 | 14.947 |
| 2.299999999999884 | -1.41 | 2.79 | 14.99 |
| 2.304999999999884 | -1.407 | 2.813 | 15.033 |
| 2.309999999999884 | -1.404 | 2.836 | 15.076 |
| 2.314999999999884 | -1.401 | 2.859 | 15.119 |
| 2.319999999999884 | -1.398 | 2.882 | 15.162 |
| 2.324999999999884 | -1.394 | 2.906 | 15.206 |
| 2.329999999999884 | -1.391 | 2.929 | 15.249 |
| 2.334999999999884 | -1.388 | 2.952 | 15.292 |
| 2.339999999999883 | -1.384 | 2.976 | 15.336 |
| 2.344999999999883 | -1.381 | 2.999 | 15.379 |
| 2.349999999999883 | -1.378 | 3.022 | 15.422 |
| 2.354999999999883 | -1.374 | 3.046 | 15.466 |
| 2.359999999999883 | -1.37 | 3.07 | 15.51 |
| 2.364999999999883 | -1.367 | 3.093 | 15.553 |
| 2.369999999999883 | -1.363 | 3.117 | 15.597 |
| 2.374999999999883 | -1.359 | 3.141 | 15.641 |
| 2.379999999999883 | -1.356 | 3.164 | 15.684 |
| 2.384999999999882 | -1.352 | 3.188 | 15.728 |
| 2.389999999999882 | -1.348 | 3.212 | 15.772 |
| 2.394999999999882 | -1.344 | 3.236 | 15.816 |
| 2.399999999999882 | -1.34 | 3.26 | 15.86 |
| 2.404999999999882 | -1.336 | 3.284 | 15.904 |
| 2.409999999999882 | -1.332 | 3.308 | 15.948 |
| 2.414999999999882 | -1.328 | 3.332 | 15.992 |
| 2.419999999999882 | -1.324 | 3.356 | 16.036 |
| 2.424999999999882 | -1.319 | 3.381 | 16.081 |
| 2.429999999999882 | -1.315 | 3.405 | 16.125 |
| 2.434999999999881 | -1.311 | 3.429 | 16.169 |
| 2.439999999999881 | -1.306 | 3.454 | 16.214 |
| 2.444999999999881 | -1.302 | 3.478 | 16.258 |
| 2.449999999999881 | -1.298 | 3.502 | 16.302 |
| 2.454999999999881 | -1.293 | 3.527 | 16.347 |
| 2.459999999999881 | -1.288 | 3.552 | 16.392 |
| 2.464999999999881 | -1.284 | 3.576 | 16.436 |
| 2.469999999999881 | -1.279 | 3.601 | 16.481 |
| 2.474999999999881 | -1.274 | 3.626 | 16.526 |
| 2.47999999999988 | -1.27 | 3.65 | 16.57 |
| 2.48499999999988 | -1.265 | 3.675 | 16.615 |
| 2.48999999999988 | -1.26 | 3.7 | 16.66 |
| 2.49499999999988 | -1.255 | 3.725 | 16.705 |
| 2.49999999999988 | -1.25 | 3.75 | 16.75 |
| 2.50499999999988 | -1.245 | 3.775 | 16.795 |
| 2.50999999999988 | -1.24 | 3.8 | 16.84 |
| 2.51499999999988 | -1.235 | 3.825 | 16.885 |
| 2.51999999999988 | -1.23 | 3.85 | 16.93 |
| 2.52499999999988 | -1.224 | 3.876 | 16.976 |
| 2.529999999999879 | -1.219 | 3.901 | 17.021 |
| 2.534999999999879 | -1.214 | 3.926 | 17.066 |
| 2.539999999999879 | -1.208 | 3.952 | 17.112 |
| 2.544999999999879 | -1.203 | 3.977 | 17.157 |
| 2.549999999999879 | -1.198 | 4.002 | 17.202 |
| 2.554999999999879 | -1.192 | 4.028 | 17.248 |
| 2.559999999999879 | -1.186 | 4.054 | 17.294 |
| 2.564999999999879 | -1.181 | 4.079 | 17.339 |
| 2.569999999999879 | -1.175 | 4.105 | 17.385 |
| 2.574999999999878 | -1.169 | 4.131 | 17.431 |
| 2.579999999999878 | -1.164 | 4.156 | 17.476 |
| 2.584999999999878 | -1.158 | 4.182 | 17.522 |
| 2.589999999999878 | -1.152 | 4.208 | 17.568 |
| 2.594999999999878 | -1.146 | 4.234 | 17.614 |
| 2.599999999999878 | -1.14 | 4.26 | 17.66 |
| 2.604999999999878 | -1.134 | 4.286 | 17.706 |
| 2.609999999999878 | -1.128 | 4.312 | 17.752 |
| 2.614999999999878 | -1.122 | 4.338 | 17.798 |
| 2.619999999999877 | -1.116 | 4.364 | 17.844 |
| 2.624999999999877 | -1.109 | 4.391 | 17.891 |
| 2.629999999999877 | -1.103 | 4.417 | 17.937 |
| 2.634999999999877 | -1.097 | 4.443 | 17.983 |
| 2.639999999999877 | -1.09 | 4.47 | 18.03 |
| 2.644999999999877 | -1.084 | 4.496 | 18.076 |
| 2.649999999999877 | -1.078 | 4.522 | 18.122 |
| 2.654999999999877 | -1.071 | 4.549 | 18.169 |
| 2.659999999999877 | -1.064 | 4.576 | 18.216 |
| 2.664999999999876 | -1.058 | 4.602 | 18.262 |
| 2.669999999999876 | -1.051 | 4.629 | 18.309 |
| 2.674999999999876 | -1.044 | 4.656 | 18.356 |
| 2.679999999999876 | -1.038 | 4.682 | 18.402 |
| 2.684999999999876 | -1.031 | 4.709 | 18.449 |
| 2.689999999999876 | -1.024 | 4.736 | 18.496 |
| 2.694999999999876 | -1.017 | 4.763 | 18.543 |
| 2.699999999999876 | -1.01 | 4.79 | 18.59 |
| 2.704999999999876 | -1.003 | 4.817 | 18.637 |
| 2.709999999999876 | -0.996 | 4.844 | 18.684 |
| 2.714999999999875 | -0.989 | 4.871 | 18.731 |
| 2.719999999999875 | -0.982 | 4.898 | 18.778 |
| 2.724999999999875 | -0.974 | 4.926 | 18.826 |
| 2.729999999999875 | -0.967 | 4.953 | 18.873 |
| 2.734999999999875 | -0.96 | 4.98 | 18.92 |
| 2.739999999999875 | -0.952 | 5.008 | 18.968 |
| 2.744999999999875 | -0.945 | 5.035 | 19.015 |
| 2.749999999999875 | -0.938 | 5.062 | 19.062 |
| 2.754999999999875 | -0.93 | 5.09 | 19.11 |
| 2.759999999999874 | -0.922 | 5.118 | 19.158 |
| 2.764999999999874 | -0.915 | 5.145 | 19.205 |
| 2.769999999999874 | -0.907 | 5.173 | 19.253 |
| 2.774999999999874 | -0.899 | 5.201 | 19.301 |
| 2.779999999999874 | -0.892 | 5.228 | 19.348 |
| 2.784999999999874 | -0.884 | 5.256 | 19.396 |
| 2.789999999999874 | -0.876 | 5.284 | 19.444 |
| 2.794999999999874 | -0.868 | 5.312 | 19.492 |
| 2.799999999999874 | -0.86 | 5.34 | 19.54 |
| 2.804999999999874 | -0.852 | 5.368 | 19.588 |
| 2.809999999999873 | -0.844 | 5.396 | 19.636 |
| 2.814999999999873 | -0.836 | 5.424 | 19.684 |
| 2.819999999999873 | -0.828 | 5.452 | 19.732 |
| 2.824999999999873 | -0.819 | 5.481 | 19.781 |
| 2.829999999999873 | -0.811 | 5.509 | 19.829 |
| 2.834999999999873 | -0.803 | 5.537 | 19.877 |
| 2.839999999999873 | -0.794 | 5.566 | 19.926 |
| 2.844999999999873 | -0.786 | 5.594 | 19.974 |
| 2.849999999999873 | -0.778 | 5.622 | 20.022 |
| 2.854999999999872 | -0.769 | 5.651 | 20.071 |
| 2.859999999999872 | -0.76 | 5.68 | 20.12 |
| 2.864999999999872 | -0.752 | 5.708 | 20.168 |
| 2.869999999999872 | -0.743 | 5.737 | 20.217 |
| 2.874999999999872 | -0.734 | 5.766 | 20.266 |
| 2.879999999999872 | -0.726 | 5.794 | 20.314 |
| 2.884999999999872 | -0.717 | 5.823 | 20.363 |
| 2.889999999999872 | -0.708 | 5.852 | 20.412 |
| 2.894999999999872 | -0.699 | 5.881 | 20.461 |
| 2.899999999999871 | -0.69 | 5.91 | 20.51 |
| 2.904999999999871 | -0.681 | 5.939 | 20.559 |
| 2.909999999999871 | -0.672 | 5.968 | 20.608 |
| 2.914999999999871 | -0.663 | 5.997 | 20.657 |
| 2.919999999999871 | -0.654 | 6.026 | 20.706 |
| 2.924999999999871 | -0.644 | 6.056 | 20.756 |
| 2.929999999999871 | -0.635 | 6.085 | 20.805 |
| 2.934999999999871 | -0.626 | 6.114 | 20.854 |
| 2.939999999999871 | -0.616 | 6.144 | 20.904 |
| 2.944999999999871 | -0.607 | 6.173 | 20.953 |
| 2.94999999999987 | -0.598 | 6.202 | 21.002 |
| 2.95499999999987 | -0.588 | 6.232 | 21.052 |
| 2.95999999999987 | -0.578 | 6.262 | 21.102 |
| 2.96499999999987 | -0.569 | 6.291 | 21.151 |
| 2.96999999999987 | -0.559 | 6.321 | 21.201 |
| 2.97499999999987 | -0.549 | 6.351 | 21.251 |
| 2.97999999999987 | -0.54 | 6.38 | 21.3 |
| 2.98499999999987 | -0.53 | 6.41 | 21.35 |
| 2.98999999999987 | -0.52 | 6.44 | 21.4 |
| 2.994999999999869 | -0.51 | 6.47 | 21.45 |
| 2.999999999999869 | -0.5 | 6.5 | 21.5 |
| 3.004999999999869 | -0.49 | 6.53 | 21.55 |
| 3.009999999999869 | -0.48 | 6.56 | 21.6 |
| 3.014999999999869 | -0.47 | 6.59 | 21.65 |
| 3.019999999999869 | -0.46 | 6.62 | 21.7 |
| 3.024999999999869 | -0.449 | 6.651 | 21.751 |
| 3.029999999999869 | -0.439 | 6.681 | 21.801 |
| 3.034999999999869 | -0.429 | 6.711 | 21.851 |
| 3.039999999999869 | -0.418 | 6.742 | 21.902 |
| 3.044999999999868 | -0.408 | 6.772 | 21.952 |
| 3.049999999999868 | -0.398 | 6.802 | 22.002 |
| 3.054999999999868 | -0.387 | 6.833 | 22.053 |
| 3.059999999999868 | -0.376 | 6.864 | 22.104 |
| 3.064999999999868 | -0.366 | 6.894 | 22.154 |
| 3.069999999999868 | -0.355 | 6.925 | 22.205 |
| 3.074999999999868 | -0.344 | 6.956 | 22.256 |
| 3.079999999999868 | -0.334 | 6.986 | 22.306 |
| 3.084999999999868 | -0.323 | 7.017 | 22.357 |
| 3.089999999999868 | -0.312 | 7.048 | 22.408 |
| 3.094999999999867 | -0.301 | 7.079 | 22.459 |
| 3.099999999999867 | -0.29 | 7.11 | 22.51 |
| 3.104999999999867 | -0.279 | 7.141 | 22.561 |
| 3.109999999999867 | -0.268 | 7.172 | 22.612 |
| 3.114999999999867 | -0.257 | 7.203 | 22.663 |
| 3.119999999999867 | -0.246 | 7.234 | 22.714 |
| 3.124999999999867 | -0.234 | 7.266 | 22.766 |
| 3.129999999999867 | -0.223 | 7.297 | 22.817 |
| 3.134999999999867 | -0.212 | 7.328 | 22.868 |
| 3.139999999999866 | -0.2 | 7.36 | 22.92 |
| 3.144999999999866 | -0.189 | 7.391 | 22.971 |
| 3.149999999999866 | -0.178 | 7.422 | 23.022 |
| 3.154999999999866 | -0.166 | 7.454 | 23.074 |
| 3.159999999999866 | -0.154 | 7.486 | 23.126 |
| 3.164999999999866 | -0.143 | 7.517 | 23.177 |
| 3.169999999999866 | -0.131 | 7.549 | 23.229 |
| 3.174999999999866 | -0.119 | 7.581 | 23.281 |
| 3.179999999999866 | -0.108 | 7.612 | 23.332 |
| 3.184999999999865 | -0.096 | 7.644 | 23.384 |
| 3.189999999999865 | -0.084 | 7.676 | 23.436 |
| 3.194999999999865 | -0.072 | 7.708 | 23.488 |
| 3.199999999999865 | -0.06 | 7.74 | 23.54 |
| 3.204999999999865 | -0.048 | 7.772 | 23.592 |
| 3.209999999999865 | -0.036 | 7.804 | 23.644 |
| 3.214999999999865 | -0.024 | 7.836 | 23.696 |
| 3.219999999999865 | -0.012 | 7.868 | 23.748 |
| 3.224999999999865 | 0.001 | 7.901 | 23.801 |
| 3.229999999999865 | 0.013 | 7.933 | 23.853 |
| 3.234999999999864 | 0.025 | 7.965 | 23.905 |
| 3.239999999999864 | 0.038 | 7.998 | 23.958 |
| 3.244999999999864 | 0.05 | 8.03 | 24.01 |
| 3.249999999999864 | 0.062 | 8.062 | 24.062 |
| 3.254999999999864 | 0.075 | 8.095 | 24.115 |
| 3.259999999999864 | 0.088 | 8.128 | 24.168 |
| 3.264999999999864 | 0.1 | 8.16 | 24.22 |
| 3.269999999999864 | 0.113 | 8.193 | 24.273 |
| 3.274999999999864 | 0.126 | 8.226 | 24.326 |
| 3.279999999999863 | 0.138 | 8.258 | 24.378 |
| 3.284999999999863 | 0.151 | 8.291 | 24.431 |
| 3.289999999999863 | 0.164 | 8.324 | 24.484 |
| 3.294999999999863 | 0.177 | 8.357 | 24.537 |
| 3.299999999999863 | 0.19 | 8.39 | 24.59 |
| 3.304999999999863 | 0.203 | 8.423 | 24.643 |
| 3.309999999999863 | 0.216 | 8.456 | 24.696 |
| 3.314999999999863 | 0.229 | 8.489 | 24.749 |
| 3.319999999999863 | 0.242 | 8.522 | 24.802 |
| 3.324999999999862 | 0.256 | 8.556 | 24.856 |
| 3.329999999999862 | 0.269 | 8.589 | 24.909 |
| 3.334999999999862 | 0.282 | 8.622 | 24.962 |
| 3.339999999999862 | 0.296 | 8.656 | 25.016 |
| 3.344999999999862 | 0.309 | 8.689 | 25.069 |
| 3.349999999999862 | 0.322 | 8.722 | 25.122 |
| 3.354999999999862 | 0.336 | 8.756 | 25.176 |
| 3.359999999999862 | 0.35 | 8.79 | 25.23 |
| 3.364999999999862 | 0.363 | 8.823 | 25.283 |
| 3.369999999999861 | 0.377 | 8.857 | 25.337 |
| 3.374999999999861 | 0.391 | 8.891 | 25.391 |
| 3.379999999999861 | 0.404 | 8.924 | 25.444 |
| 3.384999999999861 | 0.418 | 8.958 | 25.498 |
| 3.389999999999861 | 0.432 | 8.992 | 25.552 |
| 3.394999999999861 | 0.446 | 9.026 | 25.606 |
| 3.399999999999861 | 0.46 | 9.06 | 25.66 |
| 3.404999999999861 | 0.474 | 9.094 | 25.714 |
| 3.409999999999861 | 0.488 | 9.128 | 25.768 |
| 3.414999999999861 | 0.502 | 9.162 | 25.822 |
| 3.41999999999986 | 0.516 | 9.196 | 25.876 |
| 3.42499999999986 | 0.531 | 9.231 | 25.931 |
| 3.42999999999986 | 0.545 | 9.265 | 25.985 |
| 3.43499999999986 | 0.559 | 9.299 | 26.039 |
| 3.43999999999986 | 0.574 | 9.334 | 26.094 |
| 3.44499999999986 | 0.588 | 9.368 | 26.148 |
| 3.44999999999986 | 0.602 | 9.402 | 26.202 |
| 3.45499999999986 | 0.617 | 9.437 | 26.257 |
| 3.45999999999986 | 0.632 | 9.472 | 26.312 |
| 3.464999999999859 | 0.646 | 9.506 | 26.366 |
| 3.469999999999859 | 0.661 | 9.541 | 26.421 |
| 3.474999999999859 | 0.676 | 9.576 | 26.476 |
| 3.479999999999859 | 0.69 | 9.61 | 26.53 |
| 3.484999999999859 | 0.705 | 9.645 | 26.585 |
| 3.489999999999859 | 0.72 | 9.68 | 26.64 |
| 3.494999999999859 | 0.735 | 9.715 | 26.695 |
| 3.499999999999859 | 0.75 | 9.75 | 26.75 |
| 3.504999999999859 | 0.765 | 9.785 | 26.805 |
| 3.509999999999859 | 0.78 | 9.82 | 26.86 |
| 3.514999999999858 | 0.795 | 9.855 | 26.915 |
| 3.519999999999858 | 0.81 | 9.89 | 26.97 |
| 3.524999999999858 | 0.826 | 9.926 | 27.026 |
| 3.529999999999858 | 0.841 | 9.961 | 27.081 |
| 3.534999999999858 | 0.856 | 9.996 | 27.136 |
| 3.539999999999858 | 0.872 | 10.032 | 27.192 |
| 3.544999999999858 | 0.887 | 10.067 | 27.247 |
| 3.549999999999858 | 0.902 | 10.102 | 27.302 |
| 3.554999999999858 | 0.918 | 10.138 | 27.358 |
| 3.559999999999857 | 0.934 | 10.174 | 27.414 |
| 3.564999999999857 | 0.949 | 10.209 | 27.469 |
| 3.569999999999857 | 0.965 | 10.245 | 27.525 |
| 3.574999999999857 | 0.981 | 10.281 | 27.581 |
| 3.579999999999857 | 0.996 | 10.316 | 27.636 |
| 3.584999999999857 | 1.012 | 10.352 | 27.692 |
| 3.589999999999857 | 1.028 | 10.388 | 27.748 |
| 3.594999999999857 | 1.044 | 10.424 | 27.804 |
| 3.599999999999857 | 1.06 | 10.46 | 27.86 |
| 3.604999999999856 | 1.076 | 10.496 | 27.916 |
| 3.609999999999856 | 1.092 | 10.532 | 27.972 |
| 3.614999999999856 | 1.108 | 10.568 | 28.028 |
| 3.619999999999856 | 1.124 | 10.604 | 28.084 |
| 3.624999999999856 | 1.141 | 10.641 | 28.141 |
| 3.629999999999856 | 1.157 | 10.677 | 28.197 |
| 3.634999999999856 | 1.173 | 10.713 | 28.253 |
| 3.639999999999856 | 1.19 | 10.75 | 28.31 |
| 3.644999999999856 | 1.206 | 10.786 | 28.366 |
| 3.649999999999855 | 1.222 | 10.822 | 28.422 |
| 3.654999999999855 | 1.239 | 10.859 | 28.479 |
| 3.659999999999855 | 1.256 | 10.896 | 28.536 |
| 3.664999999999855 | 1.272 | 10.932 | 28.592 |
| 3.669999999999855 | 1.289 | 10.969 | 28.649 |
| 3.674999999999855 | 1.306 | 11.006 | 28.706 |
| 3.679999999999855 | 1.322 | 11.042 | 28.762 |
| 3.684999999999855 | 1.339 | 11.079 | 28.819 |
| 3.689999999999855 | 1.356 | 11.116 | 28.876 |
| 3.694999999999855 | 1.373 | 11.153 | 28.933 |
| 3.699999999999854 | 1.39 | 11.19 | 28.99 |
| 3.704999999999854 | 1.407 | 11.227 | 29.047 |
| 3.709999999999854 | 1.424 | 11.264 | 29.104 |
| 3.714999999999854 | 1.441 | 11.301 | 29.161 |
| 3.719999999999854 | 1.458 | 11.338 | 29.218 |
| 3.724999999999854 | 1.476 | 11.376 | 29.276 |
| 3.729999999999854 | 1.493 | 11.413 | 29.333 |
| 3.734999999999854 | 1.51 | 11.45 | 29.39 |
| 3.739999999999854 | 1.528 | 11.488 | 29.448 |
| 3.744999999999853 | 1.545 | 11.525 | 29.505 |
| 3.749999999999853 | 1.562 | 11.562 | 29.562 |
| 3.754999999999853 | 1.58 | 11.6 | 29.62 |
| 3.759999999999853 | 1.598 | 11.638 | 29.678 |
| 3.764999999999853 | 1.615 | 11.675 | 29.735 |
| 3.769999999999853 | 1.633 | 11.713 | 29.793 |
| 3.774999999999853 | 1.651 | 11.751 | 29.851 |
| 3.779999999999853 | 1.668 | 11.788 | 29.908 |
| 3.784999999999853 | 1.686 | 11.826 | 29.966 |
| 3.789999999999853 | 1.704 | 11.864 | 30.024 |
| 3.794999999999852 | 1.722 | 11.902 | 30.082 |
| 3.799999999999852 | 1.74 | 11.94 | 30.14 |
| 3.804999999999852 | 1.758 | 11.978 | 30.198 |
| 3.809999999999852 | 1.776 | 12.016 | 30.256 |
| 3.814999999999852 | 1.794 | 12.054 | 30.314 |
| 3.819999999999852 | 1.812 | 12.092 | 30.372 |
| 3.824999999999852 | 1.831 | 12.131 | 30.431 |
| 3.829999999999852 | 1.849 | 12.169 | 30.489 |
| 3.834999999999852 | 1.867 | 12.207 | 30.547 |
| 3.839999999999851 | 1.886 | 12.246 | 30.606 |
| 3.844999999999851 | 1.904 | 12.284 | 30.664 |
| 3.849999999999851 | 1.922 | 12.322 | 30.722 |
| 3.854999999999851 | 1.941 | 12.361 | 30.781 |
| 3.859999999999851 | 1.96 | 12.4 | 30.84 |
| 3.864999999999851 | 1.978 | 12.438 | 30.898 |
| 3.869999999999851 | 1.997 | 12.477 | 30.957 |
| 3.874999999999851 | 2.016 | 12.516 | 31.016 |
| 3.879999999999851 | 2.034 | 12.554 | 31.074 |
| 3.884999999999851 | 2.053 | 12.593 | 31.133 |
| 3.88999999999985 | 2.072 | 12.632 | 31.192 |
| 3.89499999999985 | 2.091 | 12.671 | 31.251 |
| 3.89999999999985 | 2.11 | 12.71 | 31.31 |
| 3.90499999999985 | 2.129 | 12.749 | 31.369 |
| 3.90999999999985 | 2.148 | 12.788 | 31.428 |
| 3.91499999999985 | 2.167 | 12.827 | 31.487 |
| 3.91999999999985 | 2.186 | 12.866 | 31.546 |
| 3.92499999999985 | 2.206 | 12.906 | 31.606 |
| 3.92999999999985 | 2.225 | 12.945 | 31.665 |
| 3.934999999999849 | 2.244 | 12.984 | 31.724 |
| 3.939999999999849 | 2.264 | 13.024 | 31.784 |
| 3.944999999999849 | 2.283 | 13.063 | 31.843 |
| 3.949999999999849 | 2.302 | 13.102 | 31.902 |
| 3.954999999999849 | 2.322 | 13.142 | 31.962 |
| 3.959999999999849 | 2.342 | 13.182 | 32.022 |
| 3.964999999999849 | 2.361 | 13.221 | 32.081 |
| 3.969999999999849 | 2.381 | 13.261 | 32.141 |
| 3.974999999999849 | 2.401 | 13.301 | 32.201 |
| 3.979999999999849 | 2.42 | 13.34 | 32.26 |
| 3.984999999999848 | 2.44 | 13.38 | 32.32 |
| 3.989999999999848 | 2.46 | 13.42 | 32.38 |
| 3.994999999999848 | 2.48 | 13.46 | 32.44 |
| 3.999999999999848 | 2.5 | 13.5 | 32.5 |
| 4.004999999999848 | 2.52 | 13.54 | 32.56 |
| 4.009999999999847 | 2.54 | 13.58 | 32.62 |
| 4.014999999999848 | 2.56 | 13.62 | 32.68 |
| 4.019999999999847 | 2.58 | 13.66 | 32.74 |
| 4.024999999999848 | 2.601 | 13.701 | 32.801 |
| 4.029999999999847 | 2.621 | 13.741 | 32.861 |
| 4.034999999999847 | 2.641 | 13.781 | 32.921 |
| 4.039999999999847 | 2.662 | 13.822 | 32.982 |
| 4.044999999999847 | 2.682 | 13.862 | 33.042 |
| 4.049999999999847 | 2.702 | 13.902 | 33.102 |
| 4.054999999999847 | 2.723 | 13.943 | 33.163 |
| 4.059999999999846 | 2.744 | 13.984 | 33.224 |
| 4.064999999999847 | 2.764 | 14.024 | 33.284 |
| 4.069999999999846 | 2.785 | 14.065 | 33.345 |
| 4.074999999999846 | 2.806 | 14.106 | 33.406 |
| 4.079999999999846 | 2.826 | 14.146 | 33.466 |
| 4.084999999999846 | 2.847 | 14.187 | 33.527 |
| 4.089999999999846 | 2.868 | 14.228 | 33.588 |
| 4.094999999999846 | 2.889 | 14.269 | 33.649 |
| 4.099999999999845 | 2.91 | 14.31 | 33.71 |
| 4.104999999999846 | 2.931 | 14.351 | 33.771 |
| 4.109999999999845 | 2.952 | 14.392 | 33.832 |
| 4.114999999999846 | 2.973 | 14.433 | 33.893 |
| 4.119999999999845 | 2.994 | 14.474 | 33.954 |
| 4.124999999999845 | 3.016 | 14.516 | 34.016 |
| 4.129999999999845 | 3.037 | 14.557 | 34.077 |
| 4.134999999999845 | 3.058 | 14.598 | 34.138 |
| 4.139999999999845 | 3.08 | 14.64 | 34.2 |
| 4.144999999999845 | 3.101 | 14.681 | 34.261 |
| 4.149999999999844 | 3.122 | 14.722 | 34.322 |
| 4.154999999999845 | 3.144 | 14.764 | 34.384 |
| 4.159999999999844 | 3.166 | 14.806 | 34.446 |
| 4.164999999999845 | 3.187 | 14.847 | 34.507 |
| 4.169999999999844 | 3.209 | 14.889 | 34.569 |
| 4.174999999999844 | 3.231 | 14.931 | 34.631 |
| 4.179999999999844 | 3.252 | 14.972 | 34.692 |
| 4.184999999999844 | 3.274 | 15.014 | 34.754 |
| 4.189999999999844 | 3.296 | 15.056 | 34.816 |
| 4.194999999999844 | 3.318 | 15.098 | 34.878 |
| 4.199999999999844 | 3.34 | 15.14 | 34.94 |
| 4.204999999999844 | 3.362 | 15.182 | 35.002 |
| 4.209999999999843 | 3.384 | 15.224 | 35.064 |
| 4.214999999999844 | 3.406 | 15.266 | 35.126 |
| 4.219999999999843 | 3.428 | 15.308 | 35.188 |
| 4.224999999999843 | 3.451 | 15.351 | 35.251 |
| 4.229999999999843 | 3.473 | 15.393 | 35.313 |
| 4.234999999999843 | 3.495 | 15.435 | 35.375 |
| 4.239999999999842 | 3.518 | 15.478 | 35.438 |
| 4.244999999999843 | 3.54 | 15.52 | 35.5 |
| 4.249999999999842 | 3.562 | 15.562 | 35.562 |
| 4.254999999999843 | 3.585 | 15.605 | 35.625 |
| 4.259999999999842 | 3.608 | 15.648 | 35.688 |
| 4.264999999999842 | 3.63 | 15.69 | 35.75 |
| 4.269999999999842 | 3.653 | 15.733 | 35.813 |
| 4.274999999999842 | 3.676 | 15.776 | 35.876 |
| 4.279999999999842 | 3.698 | 15.818 | 35.938 |
| 4.284999999999842 | 3.721 | 15.861 | 36.001 |
| 4.289999999999841 | 3.744 | 15.904 | 36.064 |
| 4.294999999999842 | 3.767 | 15.947 | 36.127 |
| 4.299999999999841 | 3.79 | 15.99 | 36.19 |
| 4.304999999999842 | 3.813 | 16.033 | 36.253 |
| 4.309999999999841 | 3.836 | 16.076 | 36.316 |
| 4.314999999999841 | 3.859 | 16.119 | 36.379 |
| 4.319999999999841 | 3.882 | 16.162 | 36.442 |
| 4.324999999999841 | 3.906 | 16.206 | 36.506 |
| 4.329999999999841 | 3.929 | 16.249 | 36.569 |
| 4.334999999999841 | 3.952 | 16.292 | 36.632 |
| 4.33999999999984 | 3.976 | 16.336 | 36.696 |
| 4.344999999999841 | 3.999 | 16.379 | 36.759 |
| 4.34999999999984 | 4.022 | 16.422 | 36.822 |
| 4.35499999999984 | 4.046 | 16.466 | 36.886 |
| 4.35999999999984 | 4.07 | 16.51 | 36.95 |
| 4.36499999999984 | 4.093 | 16.553 | 37.013 |
| 4.36999999999984 | 4.117 | 16.597 | 37.077 |
| 4.37499999999984 | 4.141 | 16.641 | 37.141 |
| 4.37999999999984 | 4.164 | 16.684 | 37.204 |
| 4.38499999999984 | 4.188 | 16.728 | 37.268 |
| 4.38999999999984 | 4.212 | 16.772 | 37.332 |
| 4.39499999999984 | 4.236 | 16.816 | 37.396 |
| 4.39999999999984 | 4.26 | 16.86 | 37.46 |
| 4.40499999999984 | 4.284 | 16.904 | 37.524 |
| 4.40999999999984 | 4.308 | 16.948 | 37.588 |
| 4.41499999999984 | 4.332 | 16.992 | 37.652 |
| 4.41999999999984 | 4.356 | 17.036 | 37.716 |
| 4.42499999999984 | 4.381 | 17.081 | 37.781 |
| 4.429999999999838 | 4.405 | 17.125 | 37.845 |
| 4.434999999999838 | 4.429 | 17.169 | 37.909 |
| 4.439999999999838 | 4.454 | 17.214 | 37.974 |
| 4.444999999999838 | 4.478 | 17.258 | 38.038 |
| 4.449999999999838 | 4.502 | 17.302 | 38.102 |
| 4.454999999999838 | 4.527 | 17.347 | 38.167 |
| 4.459999999999838 | 4.552 | 17.392 | 38.232 |
| 4.464999999999838 | 4.576 | 17.436 | 38.296 |
| 4.469999999999838 | 4.601 | 17.481 | 38.361 |
| 4.474999999999837 | 4.626 | 17.526 | 38.426 |
| 4.479999999999837 | 4.65 | 17.57 | 38.49 |
| 4.484999999999837 | 4.675 | 17.615 | 38.555 |
| 4.489999999999837 | 4.7 | 17.66 | 38.62 |
| 4.494999999999837 | 4.725 | 17.705 | 38.685 |
| 4.499999999999837 | 4.75 | 17.75 | 38.75 |
| 4.504999999999837 | 4.775 | 17.795 | 38.815 |
| 4.509999999999837 | 4.8 | 17.84 | 38.88 |
| 4.514999999999837 | 4.825 | 17.885 | 38.945 |
| 4.519999999999837 | 4.85 | 17.93 | 39.01 |
| 4.524999999999837 | 4.876 | 17.976 | 39.076 |
| 4.529999999999836 | 4.901 | 18.021 | 39.141 |
| 4.534999999999836 | 4.926 | 18.066 | 39.206 |
| 4.539999999999836 | 4.952 | 18.112 | 39.272 |
| 4.544999999999836 | 4.977 | 18.157 | 39.337 |
| 4.549999999999836 | 5.002 | 18.202 | 39.402 |
| 4.554999999999836 | 5.028 | 18.248 | 39.468 |
| 4.559999999999836 | 5.054 | 18.294 | 39.534 |
| 4.564999999999836 | 5.079 | 18.339 | 39.599 |
| 4.569999999999835 | 5.105 | 18.385 | 39.665 |
| 4.574999999999835 | 5.131 | 18.431 | 39.731 |
| 4.579999999999835 | 5.156 | 18.476 | 39.796 |
| 4.584999999999835 | 5.182 | 18.522 | 39.862 |
| 4.589999999999835 | 5.208 | 18.568 | 39.928 |
| 4.594999999999835 | 5.234 | 18.614 | 39.994 |
| 4.599999999999835 | 5.26 | 18.66 | 40.06 |
| 4.604999999999835 | 5.286 | 18.706 | 40.126 |
| 4.609999999999835 | 5.312 | 18.752 | 40.192 |
| 4.614999999999835 | 5.338 | 18.798 | 40.258 |
| 4.619999999999834 | 5.364 | 18.844 | 40.324 |
| 4.624999999999835 | 5.391 | 18.891 | 40.391 |
| 4.629999999999834 | 5.417 | 18.937 | 40.457 |
| 4.634999999999834 | 5.443 | 18.983 | 40.523 |
| 4.639999999999834 | 5.47 | 19.03 | 40.59 |
| 4.644999999999834 | 5.496 | 19.076 | 40.656 |
| 4.649999999999834 | 5.522 | 19.122 | 40.722 |
| 4.654999999999834 | 5.549 | 19.169 | 40.789 |
| 4.659999999999834 | 5.576 | 19.216 | 40.856 |
| 4.664999999999834 | 5.602 | 19.262 | 40.922 |
| 4.669999999999834 | 5.629 | 19.309 | 40.989 |
| 4.674999999999834 | 5.656 | 19.356 | 41.056 |
| 4.679999999999833 | 5.682 | 19.402 | 41.122 |
| 4.684999999999833 | 5.709 | 19.449 | 41.189 |
| 4.689999999999833 | 5.736 | 19.496 | 41.256 |
| 4.694999999999833 | 5.763 | 19.543 | 41.323 |
| 4.699999999999833 | 5.79 | 19.59 | 41.39 |
| 4.704999999999833 | 5.817 | 19.637 | 41.457 |
| 4.709999999999832 | 5.844 | 19.684 | 41.524 |
| 4.714999999999833 | 5.871 | 19.731 | 41.591 |
| 4.719999999999832 | 5.898 | 19.778 | 41.658 |
| 4.724999999999833 | 5.926 | 19.826 | 41.726 |
| 4.729999999999832 | 5.953 | 19.873 | 41.793 |
| 4.734999999999832 | 5.98 | 19.92 | 41.86 |
| 4.739999999999832 | 6.008 | 19.968 | 41.928 |
| 4.744999999999832 | 6.035 | 20.015 | 41.995 |
| 4.749999999999832 | 6.062 | 20.062 | 42.062 |
| 4.754999999999832 | 6.09 | 20.11 | 42.13 |
| 4.759999999999831 | 6.118 | 20.158 | 42.198 |
| 4.764999999999832 | 6.145 | 20.205 | 42.265 |
| 4.769999999999831 | 6.173 | 20.253 | 42.333 |
| 4.774999999999831 | 6.201 | 20.301 | 42.401 |
| 4.77999999999983 | 6.228 | 20.348 | 42.468 |
| 4.784999999999831 | 6.256 | 20.396 | 42.536 |
| 4.78999999999983 | 6.284 | 20.444 | 42.604 |
| 4.794999999999831 | 6.312 | 20.492 | 42.672 |
| 4.79999999999983 | 6.34 | 20.54 | 42.74 |